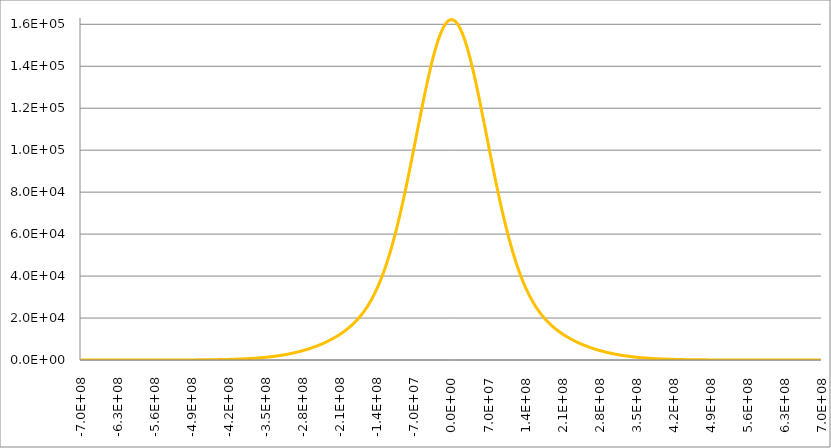
| Category | Series 1 | Series 0 | Series 2 | Series 3 |
|---|---|---|---|---|
| -695700000.0 |  |  |  | 0 |
| -695004300.0 |  |  |  | 0.001 |
| -694308600.0 |  |  |  | 0.003 |
| -693612900.0 |  |  |  | 0.004 |
| -692917200.0 |  |  |  | 0.005 |
| -692221500.0 |  |  |  | 0.007 |
| -691525800.0 |  |  |  | 0.008 |
| -690830100.0 |  |  |  | 0.009 |
| -690134400.0 |  |  |  | 0.011 |
| -689438700.0 |  |  |  | 0.013 |
| -688743000.0 |  |  |  | 0.014 |
| -688047300.0 |  |  |  | 0.016 |
| -687351600.0 |  |  |  | 0.017 |
| -686655900.0 |  |  |  | 0.019 |
| -685960200.0 |  |  |  | 0.021 |
| -685264500.0 |  |  |  | 0.023 |
| -684568800.0 |  |  |  | 0.024 |
| -683873100.0 |  |  |  | 0.026 |
| -683177400.0 |  |  |  | 0.028 |
| -682481700.0 |  |  |  | 0.03 |
| -681786000.0 |  |  |  | 0.032 |
| -681090300.0 |  |  |  | 0.034 |
| -680394600.0 |  |  |  | 0.037 |
| -679698900.0 |  |  |  | 0.039 |
| -679003200.0 |  |  |  | 0.041 |
| -678307500.0 |  |  |  | 0.043 |
| -677611800.0 |  |  |  | 0.046 |
| -676916100.0 |  |  |  | 0.048 |
| -676220400.0 |  |  |  | 0.051 |
| -675524700.0 |  |  |  | 0.053 |
| -674829000.0 |  |  |  | 0.056 |
| -674133300.0 |  |  |  | 0.059 |
| -673437600.0 |  |  |  | 0.062 |
| -672741900.0 |  |  |  | 0.064 |
| -672046200.0 |  |  |  | 0.067 |
| -671350500.0 |  |  |  | 0.07 |
| -670654800.0 |  |  |  | 0.074 |
| -669959100.0 |  |  |  | 0.077 |
| -669263400.0 |  |  |  | 0.08 |
| -668567700.0 |  |  |  | 0.083 |
| -667872000.0 |  |  |  | 0.087 |
| -667176300.0 |  |  |  | 0.09 |
| -666480600.0 |  |  |  | 0.094 |
| -665784900.0 |  |  |  | 0.097 |
| -665089200.0 |  |  |  | 0.101 |
| -664393500.0 |  |  |  | 0.105 |
| -663697800.0 |  |  |  | 0.109 |
| -663002100.0 |  |  |  | 0.113 |
| -662306400.0 |  |  |  | 0.117 |
| -661610700.0 |  |  |  | 0.122 |
| -660915000.0 |  |  |  | 0.126 |
| -660219300.0 |  |  |  | 0.131 |
| -659523600.0 |  |  |  | 0.135 |
| -658827900.0 |  |  |  | 0.14 |
| -658132200.0 |  |  |  | 0.145 |
| -657436500.0 |  |  |  | 0.15 |
| -656740800.0 |  |  |  | 0.155 |
| -656045100.0 |  |  |  | 0.16 |
| -655349400.0 |  |  |  | 0.166 |
| -654653700.0 |  |  |  | 0.171 |
| -653958000.0 |  |  |  | 0.177 |
| -653262300.0 |  |  |  | 0.182 |
| -652566600.0 |  |  |  | 0.188 |
| -651870900.0 |  |  |  | 0.194 |
| -651175200.0 |  |  |  | 0.201 |
| -650479500.0 |  |  |  | 0.207 |
| -649783800.0 |  |  |  | 0.214 |
| -649088100.0 |  |  |  | 0.22 |
| -648392400.0 |  |  |  | 0.227 |
| -647696700.0 |  |  |  | 0.234 |
| -647001000.0 |  |  |  | 0.241 |
| -646305300.0 |  |  |  | 0.249 |
| -645609600.0 |  |  |  | 0.256 |
| -644913900.0 |  |  |  | 0.264 |
| -644218200.0 |  |  |  | 0.272 |
| -643522500.0 |  |  |  | 0.28 |
| -642826800.0 |  |  |  | 0.289 |
| -642131100.0 |  |  |  | 0.297 |
| -641435400.0 |  |  |  | 0.306 |
| -640739700.0 |  |  |  | 0.315 |
| -640044000.0 |  |  |  | 0.324 |
| -639348300.0 |  |  |  | 0.334 |
| -638652600.0 |  |  |  | 0.343 |
| -637956900.0 |  |  |  | 0.353 |
| -637261200.0 |  |  |  | 0.363 |
| -636565500.0 |  |  |  | 0.374 |
| -635869800.0 |  |  |  | 0.384 |
| -635174100.0 |  |  |  | 0.395 |
| -634478400.0 |  |  |  | 0.406 |
| -633782700.0 |  |  |  | 0.418 |
| -633087000.0 |  |  |  | 0.429 |
| -632391300.0 |  |  |  | 0.441 |
| -631695600.0 |  |  |  | 0.454 |
| -630999900.0 |  |  |  | 0.466 |
| -630304200.0 |  |  |  | 0.479 |
| -629608500.0 |  |  |  | 0.492 |
| -628912800.0 |  |  |  | 0.506 |
| -628217100.0 |  |  |  | 0.52 |
| -627521400.0 |  |  |  | 0.534 |
| -626825700.0 |  |  |  | 0.548 |
| -626130000.0 |  |  |  | 0.563 |
| -625434300.0 |  |  |  | 0.578 |
| -624738600.0 |  |  |  | 0.594 |
| -624042900.0 |  |  |  | 0.61 |
| -623347200.0 |  |  |  | 0.626 |
| -622651500.0 |  |  |  | 0.643 |
| -621955800.0 |  |  |  | 0.66 |
| -621260100.0 |  |  |  | 0.677 |
| -620564400.0 |  |  |  | 0.695 |
| -619868700.0 |  |  |  | 0.713 |
| -619173000.0 |  |  |  | 0.732 |
| -618477300.0 |  |  |  | 0.751 |
| -617781600.0 |  |  |  | 0.771 |
| -617085900.0 |  |  |  | 0.791 |
| -616390200.0 |  |  |  | 0.812 |
| -615694500.0 |  |  |  | 0.833 |
| -614998800.0 |  |  |  | 0.854 |
| -614303100.0 |  |  |  | 0.876 |
| -613607400.0 |  |  |  | 0.899 |
| -612911700.0 |  |  |  | 0.922 |
| -612216000.0 |  |  |  | 0.946 |
| -611520300.0 |  |  |  | 0.97 |
| -610824600.0 |  |  |  | 0.995 |
| -610128900.0 |  |  |  | 1.02 |
| -609433200.0 |  |  |  | 1.046 |
| -608737500.0 |  |  |  | 1.072 |
| -608041800.0 |  |  |  | 1.099 |
| -607346100.0 |  |  |  | 1.127 |
| -606650400.0 |  |  |  | 1.156 |
| -605954700.0 |  |  |  | 1.185 |
| -605259000.0 |  |  |  | 1.214 |
| -604563300.0 |  |  |  | 1.245 |
| -603867600.0 |  |  |  | 1.276 |
| -603171900.0 |  |  |  | 1.308 |
| -602476200.0 |  |  |  | 1.34 |
| -601780500.0 |  |  |  | 1.373 |
| -601084800.0 |  |  |  | 1.407 |
| -600389100.0 |  |  |  | 1.442 |
| -599693400.0 |  |  |  | 1.478 |
| -598997700.0 |  |  |  | 1.514 |
| -598302000.0 |  |  |  | 1.552 |
| -597606300.0 |  |  |  | 1.59 |
| -596910600.0 |  |  |  | 1.629 |
| -596214900.0 |  |  |  | 1.668 |
| -595519200.0 |  |  |  | 1.709 |
| -594823500.0 |  |  |  | 1.751 |
| -594127800.0 |  |  |  | 1.793 |
| -593432100.0 |  |  |  | 1.837 |
| -592736400.0 |  |  |  | 1.881 |
| -592040700.0 |  |  |  | 1.927 |
| -591345000.0 |  |  |  | 1.973 |
| -590649300.0 |  |  |  | 2.021 |
| -589953600.0 |  |  |  | 2.07 |
| -589257900.0 |  |  |  | 2.119 |
| -588562200.0 |  |  |  | 2.17 |
| -587866500.0 |  |  |  | 2.222 |
| -587170800.0 |  |  |  | 2.275 |
| -586475100.0 |  |  |  | 2.33 |
| -585779400.0 |  |  |  | 2.385 |
| -585083700.0 |  |  |  | 2.442 |
| -584388000.0 |  |  |  | 2.5 |
| -583692300.0 |  |  |  | 2.559 |
| -582996600.0 |  |  |  | 2.62 |
| -582300900.0 |  |  |  | 2.682 |
| -581605200.0 |  |  |  | 2.745 |
| -580909500.0 |  |  |  | 2.81 |
| -580213800.0 |  |  |  | 2.876 |
| -579518100.0 |  |  |  | 2.943 |
| -578822400.0 |  |  |  | 3.012 |
| -578126700.0 |  |  |  | 3.083 |
| -577431000.0 |  |  |  | 3.155 |
| -576735300.0 |  |  |  | 3.228 |
| -576039600.0 |  |  |  | 3.304 |
| -575343900.0 |  |  |  | 3.38 |
| -574648200.0 |  |  |  | 3.459 |
| -573952500.0 |  |  |  | 3.539 |
| -573256800.0 |  |  |  | 3.621 |
| -572561100.0 |  |  |  | 3.705 |
| -571865400.0 |  |  |  | 3.791 |
| -571169700.0 |  |  |  | 3.878 |
| -570474000.0 |  |  |  | 3.967 |
| -569778300.0 |  |  |  | 4.058 |
| -569082600.0 |  |  |  | 4.152 |
| -568386900.0 |  |  |  | 4.247 |
| -567691200.0 |  |  |  | 4.344 |
| -566995500.0 |  |  |  | 4.443 |
| -566299800.0 |  |  |  | 4.545 |
| -565604100.0 |  |  |  | 4.648 |
| -564908400.0 |  |  |  | 4.754 |
| -564212700.0 |  |  |  | 4.862 |
| -563517000.0 |  |  |  | 4.972 |
| -562821300.0 |  |  |  | 5.085 |
| -562125600.0 |  |  |  | 5.2 |
| -561429900.0 |  |  |  | 5.317 |
| -560734200.0 |  |  |  | 5.437 |
| -560038500.0 |  |  |  | 5.56 |
| -559342800.0 |  |  |  | 5.685 |
| -558647100.0 |  |  |  | 5.812 |
| -557951400.0 |  |  |  | 5.943 |
| -557255700.0 |  |  |  | 6.076 |
| -556560000.0 |  |  |  | 6.212 |
| -555864300.0 |  |  |  | 6.35 |
| -555168600.0 |  |  |  | 6.492 |
| -554472900.0 |  |  |  | 6.637 |
| -553777200.0 |  |  |  | 6.784 |
| -553081500.0 |  |  |  | 6.935 |
| -552385800.0 |  |  |  | 7.089 |
| -551690100.0 |  |  |  | 7.245 |
| -550994400.0 |  |  |  | 7.406 |
| -550298700.0 |  |  |  | 7.569 |
| -549603000.0 |  |  |  | 7.736 |
| -548907300.0 |  |  |  | 7.906 |
| -548211600.0 |  |  |  | 8.08 |
| -547515900.0 |  |  |  | 8.258 |
| -546820200.0 |  |  |  | 8.439 |
| -546124500.0 |  |  |  | 8.623 |
| -545428800.0 |  |  |  | 8.812 |
| -544733100.0 |  |  |  | 9.004 |
| -544037400.0 |  |  |  | 9.201 |
| -543341700.0 |  |  |  | 9.401 |
| -542646000.0 |  |  |  | 9.605 |
| -541950300.0 |  |  |  | 9.814 |
| -541254600.0 |  |  |  | 10.027 |
| -540558900.0 |  |  |  | 10.244 |
| -539863200.0 |  |  |  | 10.465 |
| -539167500.0 |  |  |  | 10.691 |
| -538471800.0 |  |  |  | 10.922 |
| -537776100.0 |  |  |  | 11.157 |
| -537080400.0 |  |  |  | 11.397 |
| -536384700.0 |  |  |  | 11.641 |
| -535689000.0 |  |  |  | 11.891 |
| -534993300.0 |  |  |  | 12.145 |
| -534297600.0 |  |  |  | 12.405 |
| -533601900.0 |  |  |  | 12.67 |
| -532906200.0 |  |  |  | 12.94 |
| -532210500.0 |  |  |  | 13.216 |
| -531514800.0 |  |  |  | 13.497 |
| -530819100.0 |  |  |  | 13.783 |
| -530123400.0 |  |  |  | 14.075 |
| -529427700.0 |  |  |  | 14.373 |
| -528732000.0 |  |  |  | 14.677 |
| -528036300.0 |  |  |  | 14.987 |
| -527340600.0 |  |  |  | 15.303 |
| -526644900.0 |  |  |  | 15.625 |
| -525949200.0 |  |  |  | 15.954 |
| -525253500.0 |  |  |  | 16.289 |
| -524557800.0 |  |  |  | 16.63 |
| -523862100.0 |  |  |  | 16.979 |
| -523166400.0 |  |  |  | 17.334 |
| -522470700.0 |  |  |  | 17.696 |
| -521775000.0 |  |  |  | 18.065 |
| -521079300.0 |  |  |  | 18.441 |
| -520383600.0 |  |  |  | 18.824 |
| -519687900.0 |  |  |  | 19.215 |
| -518992200.0 |  |  |  | 19.613 |
| -518296500.0 |  |  |  | 20.019 |
| -517600800.0 |  |  |  | 20.433 |
| -516905100.0 |  |  |  | 20.855 |
| -516209400.0 |  |  |  | 21.285 |
| -515513700.0 |  |  |  | 21.723 |
| -514818000.0 |  |  |  | 22.17 |
| -514122300.0 |  |  |  | 22.625 |
| -513426600.0 |  |  |  | 23.089 |
| -512730900.0 |  |  |  | 23.562 |
| -512035200.0 |  |  |  | 24.044 |
| -511339500.0 |  |  |  | 24.534 |
| -510643800.0 |  |  |  | 25.035 |
| -509948100.0 |  |  |  | 25.544 |
| -509252400.0 |  |  |  | 26.063 |
| -508556700.0 |  |  |  | 26.593 |
| -507861000.0 |  |  |  | 27.132 |
| -507165300.0 |  |  |  | 27.681 |
| -506469600.0 |  |  |  | 28.24 |
| -505773900.0 |  |  |  | 28.81 |
| -505078200.0 |  |  |  | 29.391 |
| -504382500.0 |  |  |  | 29.983 |
| -503686800.0 |  |  |  | 30.585 |
| -502991100.0 |  |  |  | 31.199 |
| -502295400.0 |  |  |  | 31.825 |
| -501599700.0 |  |  |  | 32.462 |
| -500904000.0 |  |  |  | 33.11 |
| -500208300.0 |  |  |  | 33.771 |
| -499512600.0 |  |  |  | 34.444 |
| -498816900.0 |  |  |  | 35.13 |
| -498121200.0 |  |  |  | 35.828 |
| -497425500.0 |  |  |  | 36.539 |
| -496729800.0 |  |  |  | 37.263 |
| -496034100.0 |  |  |  | 38 |
| -495338400.0 |  |  |  | 38.751 |
| -494642700.0 |  |  |  | 39.515 |
| -493947000.0 |  |  |  | 40.294 |
| -493251300.0 |  |  |  | 41.086 |
| -492555600.0 |  |  |  | 41.893 |
| -491859900.0 |  |  |  | 42.715 |
| -491164200.0 |  |  |  | 43.552 |
| -490468500.0 |  |  |  | 44.403 |
| -489772800.0 |  |  |  | 45.271 |
| -489077100.0 |  |  |  | 46.153 |
| -488381400.0 |  |  |  | 47.052 |
| -487685700.0 |  |  |  | 47.967 |
| -486990000.0 |  |  |  | 48.899 |
| -486294300.0 |  |  |  | 49.847 |
| -485598600.0 |  |  |  | 50.812 |
| -484902900.0 |  |  |  | 51.794 |
| -484207200.0 |  |  |  | 52.794 |
| -483511500.0 |  |  |  | 53.811 |
| -482815800.0 |  |  |  | 54.847 |
| -482120100.0 |  |  |  | 55.901 |
| -481424400.0 |  |  |  | 56.974 |
| -480728700.0 |  |  |  | 58.066 |
| -480033000.0 |  |  |  | 59.177 |
| -479337300.0 |  |  |  | 60.307 |
| -478641600.0 |  |  |  | 61.458 |
| -477945900.0 |  |  |  | 62.628 |
| -477250200.0 |  |  |  | 63.82 |
| -476554500.0 |  |  |  | 65.032 |
| -475858800.0 |  |  |  | 66.265 |
| -475163100.0 |  |  |  | 67.52 |
| -474467400.0 |  |  |  | 68.796 |
| -473771700.0 |  |  |  | 70.095 |
| -473076000.0 |  |  |  | 71.417 |
| -472380300.0 |  |  |  | 72.761 |
| -471684600.0 |  |  |  | 74.128 |
| -470988900.0 |  |  |  | 75.52 |
| -470293200.0 |  |  |  | 76.935 |
| -469597500.0 |  |  |  | 78.374 |
| -468901800.0 |  |  |  | 79.838 |
| -468206100.0 |  |  |  | 81.328 |
| -467510400.0 |  |  |  | 82.843 |
| -466814700.0 |  |  |  | 84.383 |
| -466119000.0 |  |  |  | 85.95 |
| -465423300.0 |  |  |  | 87.544 |
| -464727600.0 |  |  |  | 89.165 |
| -464031900.0 |  |  |  | 90.813 |
| -463336200.0 |  |  |  | 92.489 |
| -462640500.0 |  |  |  | 94.194 |
| -461944800.0 |  |  |  | 95.927 |
| -461249100.0 |  |  |  | 97.689 |
| -460553400.0 |  |  |  | 99.481 |
| -459857700.0 |  |  |  | 101.304 |
| -459162000.0 |  |  |  | 103.156 |
| -458466300.0 |  |  |  | 105.04 |
| -457770600.0 |  |  |  | 106.955 |
| -457074900.0 |  |  |  | 108.902 |
| -456379200.0 |  |  |  | 110.882 |
| -455683500.0 |  |  |  | 112.894 |
| -454987800.0 |  |  |  | 114.94 |
| -454292100.0 |  |  |  | 117.019 |
| -453596400.0 |  |  |  | 119.133 |
| -452900700.0 |  |  |  | 121.282 |
| -452205000.0 |  |  |  | 123.466 |
| -451509300.0 |  |  |  | 125.686 |
| -450813600.0 |  |  |  | 127.942 |
| -450117900.0 |  |  |  | 130.235 |
| -449422200.0 |  |  |  | 132.566 |
| -448726500.0 |  |  |  | 134.935 |
| -448030800.0 |  |  |  | 137.342 |
| -447335100.0 |  |  |  | 139.788 |
| -446639400.0 |  |  |  | 142.274 |
| -445943700.0 |  |  |  | 144.8 |
| -445248000.0 |  |  |  | 147.367 |
| -444552300.0 |  |  |  | 149.976 |
| -443856600.0 |  |  |  | 152.626 |
| -443160900.0 |  |  |  | 155.319 |
| -442465200.0 |  |  |  | 158.055 |
| -441769500.0 |  |  |  | 160.835 |
| -441073800.0 |  |  |  | 163.659 |
| -440378100.0 |  |  |  | 166.528 |
| -439682400.0 |  |  |  | 169.443 |
| -438986700.0 |  |  |  | 172.404 |
| -438291000.0 |  |  |  | 175.412 |
| -437595300.0 |  |  |  | 178.468 |
| -436899600.0 |  |  |  | 181.572 |
| -436203900.0 |  |  |  | 184.724 |
| -435508200.0 |  |  |  | 187.927 |
| -434812500.0 |  |  |  | 191.179 |
| -434116800.0 |  |  |  | 194.483 |
| -433421100.0 |  |  |  | 197.838 |
| -432725400.0 |  |  |  | 201.246 |
| -432029700.0 |  |  |  | 204.706 |
| -431334000.0 |  |  |  | 208.22 |
| -430638300.0 |  |  |  | 211.789 |
| -429942600.0 |  |  |  | 215.414 |
| -429246900.0 |  |  |  | 219.094 |
| -428551200.0 |  |  |  | 222.831 |
| -427855500.0 |  |  |  | 226.625 |
| -427159800.0 |  |  |  | 230.478 |
| -426464100.0 |  |  |  | 234.389 |
| -425768400.0 |  |  |  | 238.361 |
| -425072700.0 |  |  |  | 242.393 |
| -424377000.0 |  |  |  | 246.487 |
| -423681300.0 |  |  |  | 250.642 |
| -422985600.0 |  |  |  | 254.861 |
| -422289900.0 |  |  |  | 259.144 |
| -421594200.0 |  |  |  | 263.492 |
| -420898500.0 |  |  |  | 267.905 |
| -420202800.0 |  |  |  | 272.384 |
| -419507100.0 |  |  |  | 276.931 |
| -418811400.0 |  |  |  | 281.546 |
| -418115700.0 |  |  |  | 286.23 |
| -417420000.0 |  |  |  | 290.984 |
| -416724300.0 |  |  |  | 295.809 |
| -416028600.0 |  |  |  | 300.706 |
| -415332900.0 |  |  |  | 305.675 |
| -414637200.0 |  |  |  | 310.718 |
| -413941500.0 |  |  |  | 315.835 |
| -413245800.0 |  |  |  | 321.028 |
| -412550100.0 |  |  |  | 326.297 |
| -411854400.0 |  |  |  | 331.643 |
| -411158700.0 |  |  |  | 337.068 |
| -410463000.0 |  |  |  | 342.572 |
| -409767300.0 |  |  |  | 348.157 |
| -409071600.0 |  |  |  | 353.823 |
| -408375900.0 |  |  |  | 359.571 |
| -407680200.0 |  |  |  | 365.403 |
| -406984500.0 |  |  |  | 371.319 |
| -406288800.0 |  |  |  | 377.32 |
| -405593100.0 |  |  |  | 383.408 |
| -404897400.0 |  |  |  | 389.583 |
| -404201700.0 |  |  |  | 395.847 |
| -403506000.0 |  |  |  | 402.201 |
| -402810300.0 |  |  |  | 408.645 |
| -402114600.0 |  |  |  | 415.181 |
| -401418900.0 |  |  |  | 421.81 |
| -400723200.0 |  |  |  | 428.534 |
| -400027500.0 |  |  |  | 435.352 |
| -399331800.0 |  |  |  | 442.267 |
| -398636100.0 |  |  |  | 449.279 |
| -397940400.0 |  |  |  | 456.39 |
| -397244700.0 |  |  |  | 463.601 |
| -396549000.0 |  |  |  | 470.913 |
| -395853300.0 |  |  |  | 478.327 |
| -395157600.0 |  |  |  | 485.844 |
| -394461900.0 |  |  |  | 493.466 |
| -393766200.0 |  |  |  | 501.194 |
| -393070500.0 |  |  |  | 509.029 |
| -392374800.0 |  |  |  | 516.972 |
| -391679100.0 |  |  |  | 525.025 |
| -390983400.0 |  |  |  | 533.188 |
| -390287700.0 |  |  |  | 541.464 |
| -389592000.0 |  |  |  | 549.853 |
| -388896300.0 |  |  |  | 558.356 |
| -388200600.0 |  |  |  | 566.976 |
| -387504900.0 |  |  |  | 575.713 |
| -386809200.0 |  |  |  | 584.568 |
| -386113500.0 |  |  |  | 593.543 |
| -385417800.0 |  |  |  | 602.64 |
| -384722100.0 |  |  |  | 611.859 |
| -384026400.0 |  |  |  | 621.202 |
| -383330700.0 |  |  |  | 630.67 |
| -382635000.0 |  |  |  | 640.266 |
| -381939300.0 |  |  |  | 649.989 |
| -381243600.0 |  |  |  | 659.842 |
| -380547900.0 |  |  |  | 669.826 |
| -379852200.0 |  |  |  | 679.942 |
| -379156500.0 |  |  |  | 690.192 |
| -378460800.0 |  |  |  | 700.578 |
| -377765100.0 |  |  |  | 711.1 |
| -377069400.0 |  |  |  | 721.761 |
| -376373700.0 |  |  |  | 732.561 |
| -375678000.0 |  |  |  | 743.502 |
| -374982300.0 |  |  |  | 754.587 |
| -374286600.0 |  |  |  | 765.815 |
| -373590900.0 |  |  |  | 777.189 |
| -372895200.0 |  |  |  | 788.711 |
| -372199500.0 |  |  |  | 800.381 |
| -371503800.0 |  |  |  | 812.202 |
| -370808100.0 |  |  |  | 824.174 |
| -370112400.0 |  |  |  | 836.3 |
| -369416700.0 |  |  |  | 848.582 |
| -368721000.0 |  |  |  | 861.02 |
| -368025300.0 |  |  |  | 873.616 |
| -367329600.0 |  |  |  | 886.373 |
| -366633900.0 |  |  |  | 899.291 |
| -365938200.0 |  |  |  | 912.372 |
| -365242500.0 |  |  |  | 925.618 |
| -364546800.0 |  |  |  | 939.031 |
| -363851100.0 |  |  |  | 952.612 |
| -363155400.0 |  |  |  | 966.363 |
| -362459700.0 |  |  |  | 980.286 |
| -361764000.0 |  |  |  | 994.381 |
| -361068300.0 |  |  |  | 1008.652 |
| -360372600.0 |  |  |  | 1023.1 |
| -359676900.0 |  |  |  | 1037.726 |
| -358981200.0 |  |  |  | 1052.533 |
| -358285500.0 |  |  |  | 1067.521 |
| -357589800.0 |  |  |  | 1082.693 |
| -356894100.0 |  |  |  | 1098.051 |
| -356198400.0 |  |  |  | 1113.596 |
| -355502700.0 |  |  |  | 1129.33 |
| -354807000.0 |  |  |  | 1145.256 |
| -354111300.0 |  |  |  | 1161.373 |
| -353415600.0 |  |  |  | 1177.686 |
| -352719900.0 |  |  |  | 1194.195 |
| -352024200.0 |  |  |  | 1210.902 |
| -351328500.0 |  |  |  | 1227.809 |
| -350632800.0 |  |  |  | 1244.918 |
| -349937100.0 |  |  |  | 1262.231 |
| -349241400.0 |  |  |  | 1279.75 |
| -348545700.0 |  |  |  | 1297.477 |
| -347850000.0 |  |  |  | 1315.412 |
| -347154300.0 |  |  |  | 1333.56 |
| -346458600.0 |  |  |  | 1351.921 |
| -345762900.0 |  |  |  | 1370.496 |
| -345067200.0 |  |  |  | 1389.29 |
| -344371500.0 |  |  |  | 1408.302 |
| -343675800.0 |  |  |  | 1427.536 |
| -342980100.0 |  |  |  | 1446.992 |
| -342284400.0 |  |  |  | 1466.674 |
| -341588700.0 |  |  |  | 1486.583 |
| -340893000.0 |  |  |  | 1506.72 |
| -340197300.0 |  |  |  | 1527.089 |
| -339501600.0 |  |  |  | 1547.691 |
| -338805900.0 |  |  |  | 1568.528 |
| -338110200.0 |  |  |  | 1589.602 |
| -337414500.0 |  |  |  | 1610.915 |
| -336718800.0 |  |  |  | 1632.469 |
| -336023100.0 |  |  |  | 1654.267 |
| -335327400.0 |  |  |  | 1676.309 |
| -334631700.0 |  |  |  | 1698.599 |
| -333936000.0 |  |  |  | 1721.139 |
| -333240300.0 |  |  |  | 1743.93 |
| -332544600.0 |  |  |  | 1766.974 |
| -331848900.0 |  |  |  | 1790.274 |
| -331153200.0 |  |  |  | 1813.832 |
| -330457500.0 |  |  |  | 1837.65 |
| -329761800.0 |  |  |  | 1861.73 |
| -329066100.0 |  |  |  | 1886.074 |
| -328370400.0 |  |  |  | 1910.684 |
| -327674700.0 |  |  |  | 1935.562 |
| -326979000.0 |  |  |  | 1960.711 |
| -326283300.0 |  |  |  | 1986.133 |
| -325587600.0 |  |  |  | 2011.829 |
| -324891900.0 |  |  |  | 2037.803 |
| -324196200.0 |  |  |  | 2064.056 |
| -323500500.0 |  |  |  | 2090.59 |
| -322804800.0 |  |  |  | 2117.407 |
| -322109100.0 |  |  |  | 2144.511 |
| -321413400.0 |  |  |  | 2171.902 |
| -320717700.0 |  |  |  | 2199.583 |
| -320022000.0 |  |  |  | 2227.557 |
| -319326300.0 |  |  |  | 2255.825 |
| -318630600.0 |  |  |  | 2284.39 |
| -317934900.0 |  |  |  | 2313.254 |
| -317239200.0 |  |  |  | 2342.419 |
| -316543500.0 |  |  |  | 2371.888 |
| -315847800.0 |  |  |  | 2401.663 |
| -315152100.0 |  |  |  | 2431.745 |
| -314456400.0 |  |  |  | 2462.137 |
| -313760700.0 |  |  |  | 2492.842 |
| -313065000.0 |  |  |  | 2523.862 |
| -312369300.0 |  |  |  | 2555.199 |
| -311673600.0 |  |  |  | 2586.855 |
| -310977900.0 |  |  |  | 2618.832 |
| -310282200.0 |  |  |  | 2651.133 |
| -309586500.0 |  |  |  | 2683.761 |
| -308890800.0 |  |  |  | 2716.717 |
| -308195100.0 |  |  |  | 2750.003 |
| -307499400.0 |  |  |  | 2783.623 |
| -306803700.0 |  |  |  | 2817.578 |
| -306108000.0 |  |  |  | 2851.87 |
| -305412300.0 |  |  |  | 2886.503 |
| -304716600.0 |  |  |  | 2921.477 |
| -304020900.0 |  |  |  | 2956.797 |
| -303325200.0 |  |  |  | 2992.463 |
| -302629500.0 |  |  |  | 3028.479 |
| -301933800.0 |  |  |  | 3064.846 |
| -301238100.0 |  |  |  | 3101.567 |
| -300542400.0 |  |  |  | 3138.645 |
| -299846700.0 |  |  |  | 3176.081 |
| -299151000.0 |  |  |  | 3213.879 |
| -298455300.0 |  |  |  | 3252.039 |
| -297759600.0 |  |  |  | 3290.566 |
| -297063900.0 |  |  |  | 3329.461 |
| -296368200.0 |  |  |  | 3368.726 |
| -295672500.0 |  |  |  | 3408.365 |
| -294976800.0 |  |  |  | 3448.379 |
| -294281100.0 |  |  |  | 3488.77 |
| -293585400.0 |  |  |  | 3529.542 |
| -292889700.0 |  |  |  | 3570.696 |
| -292194000.0 |  |  |  | 3612.236 |
| -291498300.0 |  |  |  | 3654.163 |
| -290802600.0 |  |  |  | 3696.48 |
| -290106900.0 |  |  |  | 3739.189 |
| -289411200.0 |  |  |  | 3782.293 |
| -288715500.0 |  |  |  | 3825.795 |
| -288019800.0 |  |  |  | 3869.696 |
| -287324100.0 |  |  |  | 3914 |
| -286628400.0 |  |  |  | 3958.708 |
| -285932700.0 |  |  |  | 4003.824 |
| -285237000.0 |  |  |  | 4049.349 |
| -284541300.0 |  |  |  | 4095.287 |
| -283845600.0 |  |  |  | 4141.639 |
| -283149900.0 |  |  |  | 4188.409 |
| -282454200.0 |  |  |  | 4235.599 |
| -281758500.0 |  |  |  | 4283.211 |
| -281062800.0 |  |  |  | 4331.249 |
| -280367100.0 |  |  |  | 4379.714 |
| -279671400.0 |  |  |  | 4428.609 |
| -278975700.0 |  |  |  | 4477.938 |
| -278280000.0 |  |  |  | 4527.701 |
| -277584300.0 |  |  |  | 4577.904 |
| -276888600.0 |  |  |  | 4628.547 |
| -276192900.0 |  |  |  | 4679.633 |
| -275497200.0 |  |  |  | 4731.166 |
| -274801500.0 |  |  |  | 4783.148 |
| -274105800.0 |  |  |  | 4835.582 |
| -273410100.0 |  |  |  | 4888.47 |
| -272714400.0 |  |  |  | 4941.816 |
| -272018700.0 |  |  |  | 4995.622 |
| -271323000.0 |  |  |  | 5049.89 |
| -270627300.0 |  |  |  | 5104.625 |
| -269931600.0 |  |  |  | 5159.829 |
| -269235900.0 |  |  |  | 5215.504 |
| -268540200.0 |  |  |  | 5271.653 |
| -267844500.0 |  |  |  | 5328.281 |
| -267148800.0 |  |  |  | 5385.388 |
| -266453100.0 |  |  |  | 5442.98 |
| -265757400.0 |  |  |  | 5501.058 |
| -265061700.0 |  |  |  | 5559.626 |
| -264366000.0 |  |  |  | 5618.687 |
| -263670300.0 |  |  |  | 5678.244 |
| -262974600.0 |  |  |  | 5738.301 |
| -262278900.0 |  |  |  | 5798.86 |
| -261583200.0 |  |  |  | 5859.925 |
| -260887500.0 |  |  |  | 5921.499 |
| -260191800.0 |  |  |  | 5983.586 |
| -259496100.0 |  |  |  | 6046.189 |
| -258800400.0 |  |  |  | 6109.311 |
| -258104700.0 |  |  |  | 6172.957 |
| -257409000.0 |  |  |  | 6237.129 |
| -256713300.0 |  |  |  | 6301.832 |
| -256017600.0 |  |  |  | 6367.069 |
| -255321900.0 |  |  |  | 6432.844 |
| -254626200.0 |  |  |  | 6499.16 |
| -253930500.0 |  |  |  | 6566.022 |
| -253234800.0 |  |  |  | 6633.434 |
| -252539100.0 |  |  |  | 6701.399 |
| -251843400.0 |  |  |  | 6769.922 |
| -251147700.0 |  |  |  | 6839.006 |
| -250452000.0 |  |  |  | 6908.657 |
| -249756300.0 |  |  |  | 6978.878 |
| -249060600.0 |  |  |  | 7049.675 |
| -248364900.0 |  |  |  | 7121.05 |
| -247669200.0 |  |  |  | 7193.01 |
| -246973500.0 |  |  |  | 7265.558 |
| -246277800.0 |  |  |  | 7338.7 |
| -245582100.0 |  |  |  | 7412.44 |
| -244886400.0 |  |  |  | 7486.783 |
| -244190700.0 |  |  |  | 7561.735 |
| -243495000.0 |  |  |  | 7637.3 |
| -242799300.0 |  |  |  | 7713.485 |
| -242103600.0 |  |  |  | 7790.293 |
| -241407900.0 |  |  |  | 7867.732 |
| -240712200.0 |  |  |  | 7945.806 |
| -240016500.0 |  |  |  | 8024.521 |
| -239320800.0 |  |  |  | 8103.883 |
| -238625100.0 |  |  |  | 8183.899 |
| -237929400.0 |  |  |  | 8264.574 |
| -237233700.0 |  |  |  | 8345.914 |
| -236538000.0 |  |  |  | 8427.927 |
| -235842300.0 |  |  |  | 8510.619 |
| -235146600.0 |  |  |  | 8593.997 |
| -234450900.0 |  |  |  | 8678.067 |
| -233755200.0 |  |  |  | 8762.836 |
| -233059500.0 |  |  |  | 8848.313 |
| -232363800.0 |  |  |  | 8934.504 |
| -231668100.0 |  |  |  | 9021.416 |
| -230972400.0 |  |  |  | 9109.059 |
| -230276700.0 |  |  |  | 9197.439 |
| -229581000.0 |  |  |  | 9286.566 |
| -228885300.0 |  |  |  | 9376.446 |
| -228189600.0 |  |  |  | 9467.09 |
| -227493900.0 |  |  |  | 9558.505 |
| -226798200.0 |  |  |  | 9650.701 |
| -226102500.0 |  |  |  | 9743.686 |
| -225406800.0 |  |  |  | 9837.471 |
| -224711100.0 |  |  |  | 9932.065 |
| -224015400.0 |  |  |  | 10027.478 |
| -223319700.0 |  |  |  | 10123.72 |
| -222624000.0 |  |  |  | 10220.802 |
| -221928300.0 |  |  |  | 10318.733 |
| -221232600.0 |  |  |  | 10417.526 |
| -220536900.0 |  |  |  | 10517.19 |
| -219841200.0 |  |  |  | 10617.739 |
| -219145500.0 |  |  |  | 10719.182 |
| -218449800.0 |  |  |  | 10821.533 |
| -217754100.0 |  |  |  | 10924.803 |
| -217058400.0 |  |  |  | 11029.006 |
| -216362700.0 |  |  |  | 11134.153 |
| -215667000.0 |  |  |  | 11240.259 |
| -214971300.0 |  |  |  | 11347.336 |
| -214275600.0 |  |  |  | 11455.399 |
| -213579900.0 |  |  |  | 11564.461 |
| -212884200.0 |  |  |  | 11674.538 |
| -212188500.0 |  |  |  | 11785.643 |
| -211492800.0 |  |  |  | 11897.793 |
| -210797100.0 |  |  |  | 12011.002 |
| -210101400.0 |  |  |  | 12125.286 |
| -209405700.0 |  |  |  | 12240.662 |
| -208710000.0 |  |  |  | 12357.147 |
| -208014300.0 |  |  |  | 12474.757 |
| -207318600.0 |  |  |  | 12593.509 |
| -206622900.0 |  |  |  | 12713.421 |
| -205927200.0 |  |  |  | 12834.512 |
| -205231500.0 |  |  |  | 12956.8 |
| -204535800.0 |  |  |  | 13080.304 |
| -203840100.0 |  |  |  | 13205.043 |
| -203144400.0 |  |  |  | 13331.038 |
| -202448700.0 |  |  |  | 13458.308 |
| -201753000.0 |  |  |  | 13586.873 |
| -201057300.0 |  |  |  | 13716.756 |
| -200361600.0 |  |  |  | 13847.978 |
| -199665900.0 |  |  |  | 13980.56 |
| -198970200.0 |  |  |  | 14114.525 |
| -198274500.0 |  |  |  | 14249.896 |
| -197578800.0 |  |  |  | 14386.696 |
| -196883100.0 |  |  |  | 14524.95 |
| -196187400.0 |  |  |  | 14664.681 |
| -195491700.0 |  |  |  | 14805.915 |
| -194796000.0 |  |  |  | 14948.676 |
| -194100300.0 |  |  |  | 15092.991 |
| -193404600.0 |  |  |  | 15238.885 |
| -192708900.0 |  |  |  | 15386.386 |
| -192013200.0 |  |  |  | 15535.521 |
| -191317500.0 |  |  |  | 15686.318 |
| -190621800.0 |  |  |  | 15838.805 |
| -189926100.0 |  |  |  | 15993.011 |
| -189230400.0 |  |  |  | 16148.965 |
| -188534700.0 |  |  |  | 16306.698 |
| -187839000.0 |  |  |  | 16466.24 |
| -187143300.0 |  |  |  | 16627.621 |
| -186447600.0 |  |  |  | 16790.874 |
| -185751900.0 |  |  |  | 16956.03 |
| -185056200.0 |  |  |  | 17123.122 |
| -184360500.0 |  |  |  | 17292.184 |
| -183664800.0 |  |  |  | 17463.248 |
| -182969100.0 |  |  |  | 17636.35 |
| -182273400.0 |  |  |  | 17811.524 |
| -181577700.0 |  |  |  | 17988.805 |
| -180882000.0 |  |  |  | 18168.23 |
| -180186300.0 |  |  |  | 18349.835 |
| -179490600.0 |  |  |  | 18533.657 |
| -178794900.0 |  |  |  | 18719.733 |
| -178099200.0 |  |  |  | 18908.101 |
| -177403500.0 |  |  |  | 19098.801 |
| -176707800.0 |  |  |  | 19291.872 |
| -176012100.0 |  |  |  | 19487.353 |
| -175316400.0 |  |  |  | 19685.285 |
| -174620700.0 |  |  |  | 19885.708 |
| -173925000.0 |  |  |  | 20088.664 |
| -173229300.0 |  |  |  | 20294.195 |
| -172533600.0 |  |  |  | 20502.343 |
| -171837900.0 |  |  |  | 20713.151 |
| -171142200.0 |  |  |  | 20926.663 |
| -170446500.0 |  |  |  | 21142.923 |
| -169750800.0 |  |  |  | 21361.975 |
| -169055100.0 |  |  |  | 21583.865 |
| -168359400.0 |  |  |  | 21808.637 |
| -167663700.0 |  |  |  | 22036.338 |
| -166968000.0 |  |  |  | 22267.015 |
| -166272300.0 |  |  |  | 22500.713 |
| -165576600.0 |  |  |  | 22737.481 |
| -164880900.0 |  |  |  | 22977.366 |
| -164185200.0 |  |  |  | 23220.417 |
| -163489500.0 |  |  |  | 23466.683 |
| -162793800.0 |  |  |  | 23716.211 |
| -162098100.0 |  |  |  | 23969.053 |
| -161402400.0 |  |  |  | 24225.257 |
| -160706700.0 |  |  |  | 24484.874 |
| -160011000.0 |  |  |  | 24747.955 |
| -159315300.0 |  |  |  | 25014.55 |
| -158619600.0 |  |  |  | 25284.711 |
| -157923900.0 |  |  |  | 25558.489 |
| -157228200.0 |  |  |  | 25835.937 |
| -156532500.0 |  |  |  | 26117.105 |
| -155836800.0 |  |  |  | 26402.048 |
| -155141100.0 |  |  |  | 26690.817 |
| -154445400.0 |  |  |  | 26983.464 |
| -153749700.0 |  |  |  | 27280.044 |
| -153054000.0 |  |  |  | 27580.61 |
| -152358300.0 |  |  |  | 27885.214 |
| -151662600.0 |  |  |  | 28193.91 |
| -150966900.0 |  |  |  | 28506.752 |
| -150271200.0 |  |  |  | 28823.793 |
| -149575500.0 |  |  |  | 29145.088 |
| -148879800.0 |  |  |  | 29470.689 |
| -148184100.0 |  |  |  | 29800.65 |
| -147488400.0 |  |  |  | 30135.026 |
| -146792700.0 |  |  |  | 30473.87 |
| -146097000.0 |  |  |  | 30817.234 |
| -145401300.0 |  |  |  | 31165.174 |
| -144705600.0 |  |  |  | 31517.742 |
| -144009900.0 |  |  |  | 31874.991 |
| -143314200.0 |  |  |  | 32236.974 |
| -142618500.0 |  |  |  | 32603.744 |
| -141922800.0 |  |  |  | 32975.353 |
| -141227100.0 |  |  |  | 33351.854 |
| -140531400.0 |  |  |  | 33733.297 |
| -139835700.0 |  |  |  | 34119.735 |
| -139140000.0 |  |  |  | 34511.218 |
| -138444300.0 |  |  |  | 34907.797 |
| -137748600.0 |  |  |  | 35309.522 |
| -137052900.0 |  |  |  | 35716.442 |
| -136357200.0 |  |  |  | 36128.607 |
| -135661500.0 |  |  |  | 36546.064 |
| -134965800.0 |  |  |  | 36968.862 |
| -134270100.0 |  |  |  | 37397.047 |
| -133574400.0 |  |  |  | 37830.665 |
| -132878700.0 |  |  |  | 38269.763 |
| -132183000.0 |  |  |  | 38714.385 |
| -131487300.0 |  |  |  | 39164.575 |
| -130791600.0 |  |  |  | 39620.375 |
| -130095900.0 |  |  |  | 40081.829 |
| -129400200.0 |  |  |  | 40548.976 |
| -128704500.0 |  |  |  | 41021.857 |
| -128008800.0 |  |  |  | 41500.512 |
| -127313100.0 |  |  |  | 41984.977 |
| -126617400.0 |  |  |  | 42475.29 |
| -125921700.0 |  |  |  | 42971.487 |
| -125226000.0 |  |  |  | 43473.6 |
| -124530300.0 |  |  |  | 43981.664 |
| -123834600.0 |  |  |  | 44495.711 |
| -123138900.0 |  |  |  | 45015.769 |
| -122443200.0 |  |  |  | 45541.869 |
| -121747500.0 |  |  |  | 46074.038 |
| -121051800.0 |  |  |  | 46612.301 |
| -120356100.0 |  |  |  | 47156.682 |
| -119660400.0 |  |  |  | 47707.205 |
| -118964700.0 |  |  |  | 48263.89 |
| -118269000.0 |  |  |  | 48826.757 |
| -117573300.0 |  |  |  | 49395.823 |
| -116877600.0 |  |  |  | 49971.103 |
| -116181900.0 |  |  |  | 50552.611 |
| -115486200.0 |  |  |  | 51140.36 |
| -114790500.0 |  |  |  | 51734.36 |
| -114094800.0 |  |  |  | 52334.617 |
| -113399100.0 |  |  |  | 52941.138 |
| -112703400.0 |  |  |  | 53553.928 |
| -112007700.0 |  |  |  | 54172.987 |
| -111312000.0 |  |  |  | 54798.315 |
| -110616300.0 |  |  |  | 55429.909 |
| -109920600.0 |  |  |  | 56067.765 |
| -109224900.0 |  |  |  | 56711.875 |
| -108529200.0 |  |  |  | 57362.229 |
| -107833500.0 |  |  |  | 58018.815 |
| -107137800.0 |  |  |  | 58681.618 |
| -106442100.0 |  |  |  | 59350.622 |
| -105746400.0 |  |  |  | 60025.807 |
| -105050700.0 |  |  |  | 60707.151 |
| -104355000.0 |  |  |  | 61394.629 |
| -103659300.0 |  |  |  | 62088.214 |
| -102963600.0 |  |  |  | 62787.875 |
| -102267900.0 |  |  |  | 63493.58 |
| -101572200.0 |  |  |  | 64205.293 |
| -100876500.0 |  |  |  | 64922.976 |
| -100180800.0 |  |  |  | 65646.587 |
| -99485100.0 |  |  |  | 66376.083 |
| -98789400.0 |  |  |  | 67111.417 |
| -98093700.0 |  |  |  | 67852.538 |
| -97398000.0 |  |  |  | 68599.394 |
| -96702300.0 |  |  |  | 69351.929 |
| -96006600.0 |  |  |  | 70110.085 |
| -95310900.0 |  |  |  | 70873.799 |
| -94615200.0 |  |  |  | 71643.006 |
| -93919500.0 |  |  |  | 72417.64 |
| -93223800.0 |  |  |  | 73197.627 |
| -92528100.0 |  |  |  | 73982.895 |
| -91832400.0 |  |  |  | 74773.366 |
| -91136700.0 |  |  |  | 75568.959 |
| -90441000.0 |  |  |  | 76369.591 |
| -89745300.0 |  |  |  | 77175.175 |
| -89049600.0 |  |  |  | 77985.621 |
| -88353900.0 |  |  |  | 78800.835 |
| -87658200.0 |  |  |  | 79620.722 |
| -86962500.0 |  |  |  | 80445.182 |
| -86266800.0 |  |  |  | 81274.111 |
| -85571100.0 |  |  |  | 82107.404 |
| -84875400.0 |  |  |  | 82944.951 |
| -84179700.0 |  |  |  | 83786.64 |
| -83484000.0 |  |  |  | 84632.355 |
| -82788300.0 |  |  |  | 85481.977 |
| -82092600.0 |  |  |  | 86335.384 |
| -81396900.0 |  |  |  | 87192.451 |
| -80701200.0 |  |  |  | 88053.048 |
| -80005500.0 |  |  |  | 88917.045 |
| -79309800.0 |  |  |  | 89784.306 |
| -78614100.0 |  |  |  | 90654.694 |
| -77918400.0 |  |  |  | 91528.067 |
| -77222700.0 |  |  |  | 92404.281 |
| -76527000.0 |  |  |  | 93283.19 |
| -75831300.0 |  |  |  | 94164.641 |
| -75135600.0 |  |  |  | 95048.483 |
| -74439900.0 |  |  |  | 95934.559 |
| -73744200.0 |  |  |  | 96822.709 |
| -73048500.0 |  |  |  | 97712.772 |
| -72352800.0 |  |  |  | 98604.583 |
| -71657100.0 |  |  |  | 99497.973 |
| -70961400.0 |  |  |  | 100392.772 |
| -70265700.0 |  |  |  | 101288.807 |
| -69570000.0 |  |  |  | 102185.9 |
| -68874300.0 |  |  |  | 103083.875 |
| -68178600.0 |  |  |  | 103982.549 |
| -67482900.0 |  |  |  | 104881.738 |
| -66787200.0 |  |  |  | 105781.257 |
| -66091500.0 |  |  |  | 106680.915 |
| -65395800.0 |  |  |  | 107580.522 |
| -64700100.0 |  |  |  | 108479.885 |
| -64004400.0 |  |  |  | 109378.807 |
| -63308700.0 |  |  |  | 110277.091 |
| -62613000.0 |  |  |  | 111174.536 |
| -61917300.0 |  |  |  | 112070.941 |
| -61221600.0 |  |  |  | 112966.101 |
| -60525900.0 |  |  |  | 113859.811 |
| -59830200.0 |  |  |  | 114751.862 |
| -59134500.0 |  |  |  | 115642.045 |
| -58438800.0 |  |  |  | 116530.148 |
| -57743100.0 |  |  |  | 117415.96 |
| -57047400.0 |  |  |  | 118299.264 |
| -56351700.0 |  |  |  | 119179.847 |
| -55656000.0 |  |  |  | 120057.491 |
| -54960300.0 |  |  |  | 120931.977 |
| -54264600.0 |  |  |  | 121803.086 |
| -53568900.0 |  |  |  | 122670.597 |
| -52873200.0 |  |  |  | 123534.29 |
| -52177500.0 |  |  |  | 124393.941 |
| -51481800.0 |  |  |  | 125249.328 |
| -50786100.0 |  |  |  | 126100.226 |
| -50090400.0 |  |  |  | 126946.412 |
| -49394700.0 |  |  |  | 127787.661 |
| -48699000.0 |  |  |  | 128623.747 |
| -48003300.0 |  |  |  | 129454.445 |
| -47307600.0 |  |  |  | 130279.529 |
| -46611900.0 |  |  |  | 131098.773 |
| -45916200.0 |  |  |  | 131911.953 |
| -45220500.0 |  |  |  | 132718.842 |
| -44524800.0 |  |  |  | 133519.215 |
| -43829100.0 |  |  |  | 134312.847 |
| -43133400.0 |  |  |  | 135099.513 |
| -42437700.0 |  |  |  | 135878.991 |
| -41742000.0 |  |  |  | 136651.057 |
| -41046300.0 |  |  |  | 137415.488 |
| -40350600.0 |  |  |  | 138172.063 |
| -39654900.0 |  |  |  | 138920.561 |
| -38959200.0 |  |  |  | 139660.764 |
| -38263500.0 |  |  |  | 140392.453 |
| -37567800.0 |  |  |  | 141115.411 |
| -36872100.0 |  |  |  | 141829.424 |
| -36176400.0 |  |  |  | 142534.277 |
| -35480700.0 |  |  |  | 143229.76 |
| -34785000.0 |  |  |  | 143915.661 |
| -34089300.0 |  |  |  | 144591.772 |
| -33393600.0 |  |  |  | 145257.887 |
| -32697900.0 |  |  |  | 145913.803 |
| -32002200.0 |  |  |  | 146559.316 |
| -31306500.0 |  |  |  | 147194.229 |
| -30610800.0 |  |  |  | 147818.343 |
| -29915100.0 |  |  |  | 148431.464 |
| -29219400.0 |  |  |  | 149033.4 |
| -28523700.0 |  |  |  | 149623.963 |
| -27828000.0 |  |  |  | 150202.966 |
| -27132300.0 |  |  |  | 150770.225 |
| -26436600.0 |  |  |  | 151325.562 |
| -25740900.0 |  |  |  | 151868.798 |
| -25045200.0 |  |  |  | 152399.76 |
| -24349500.0 |  |  |  | 152918.278 |
| -23653800.0 |  |  |  | 153424.184 |
| -22958100.0 |  |  |  | 153917.316 |
| -22262400.0 |  |  |  | 154397.514 |
| -21566700.0 |  |  |  | 154864.622 |
| -20871000.0 |  |  |  | 155318.488 |
| -20175300.0 |  |  |  | 155758.963 |
| -19479600.0 |  |  |  | 156185.904 |
| -18783900.0 |  |  |  | 156599.17 |
| -18088200.0 |  |  |  | 156998.625 |
| -17392500.0 |  |  |  | 157384.138 |
| -16696800.0 |  |  |  | 157755.582 |
| -16001100.0 |  |  |  | 158112.832 |
| -15305400.0 |  |  |  | 158455.772 |
| -14609700.0 |  |  |  | 158784.286 |
| -13914000.0 |  |  |  | 159098.265 |
| -13218300.0 |  |  |  | 159397.605 |
| -12522600.0 |  |  |  | 159682.205 |
| -11826900.0 |  |  |  | 159951.97 |
| -11131200.0 |  |  |  | 160206.81 |
| -10435500.0 |  |  |  | 160446.639 |
| -9739800.0 |  |  |  | 160671.376 |
| -9044100.0 |  |  |  | 160880.946 |
| -8348400.0 |  |  |  | 161075.278 |
| -7652700.0 |  |  |  | 161254.306 |
| -6957000.0 |  |  |  | 161417.971 |
| -6261300.0 |  |  |  | 161566.216 |
| -5565600.0 |  |  |  | 161698.991 |
| -4869900.0 |  |  |  | 161816.252 |
| -4174200.0 |  |  |  | 161917.959 |
| -3478500.0 |  |  |  | 162004.077 |
| -2782800.0 |  |  |  | 162074.578 |
| -2087100.0 |  |  |  | 162129.436 |
| -1391400.0 |  |  |  | 162168.634 |
| -695700.0 |  |  |  | 162192.158 |
| 0.0 |  |  |  | 1622 |
| 695700.0 |  |  |  | 162192.158 |
| 1391400.0 |  |  |  | 162168.634 |
| 2087100.0 |  |  |  | 162129.436 |
| 2782800.0 |  |  |  | 162074.578 |
| 3478500.0 |  |  |  | 162004.077 |
| 4174200.0 |  |  |  | 161917.959 |
| 4869900.0 |  |  |  | 161816.252 |
| 5565600.0 |  |  |  | 161698.991 |
| 6261300.0 |  |  |  | 161566.216 |
| 6957000.0 |  |  |  | 161417.971 |
| 7652700.0 |  |  |  | 161254.306 |
| 8348400.0 |  |  |  | 161075.278 |
| 9044100.0 |  |  |  | 160880.946 |
| 9739800.0 |  |  |  | 160671.376 |
| 10435500.0 |  |  |  | 160446.639 |
| 11131200.0 |  |  |  | 160206.81 |
| 11826900.0 |  |  |  | 159951.97 |
| 12522600.0 |  |  |  | 159682.205 |
| 13218300.0 |  |  |  | 159397.605 |
| 13914000.0 |  |  |  | 159098.265 |
| 14609700.0 |  |  |  | 158784.286 |
| 15305400.0 |  |  |  | 158455.772 |
| 16001100.0 |  |  |  | 158112.832 |
| 16696800.0 |  |  |  | 157755.582 |
| 17392500.0 |  |  |  | 157384.138 |
| 18088200.0 |  |  |  | 156998.625 |
| 18783900.0 |  |  |  | 156599.17 |
| 19479600.0 |  |  |  | 156185.904 |
| 20175300.0 |  |  |  | 155758.963 |
| 20871000.0 |  |  |  | 155318.488 |
| 21566700.0 |  |  |  | 154864.622 |
| 22262400.0 |  |  |  | 154397.514 |
| 22958100.0 |  |  |  | 153917.316 |
| 23653800.0 |  |  |  | 153424.184 |
| 24349500.0 |  |  |  | 152918.278 |
| 25045200.0 |  |  |  | 152399.76 |
| 25740900.0 |  |  |  | 151868.798 |
| 26436600.0 |  |  |  | 151325.562 |
| 27132300.0 |  |  |  | 150770.225 |
| 27828000.0 |  |  |  | 150202.966 |
| 28523700.0 |  |  |  | 149623.963 |
| 29219400.0 |  |  |  | 149033.4 |
| 29915100.0 |  |  |  | 148431.464 |
| 30610800.0 |  |  |  | 147818.343 |
| 31306500.0 |  |  |  | 147194.229 |
| 32002200.0 |  |  |  | 146559.316 |
| 32697900.0 |  |  |  | 145913.803 |
| 33393600.0 |  |  |  | 145257.887 |
| 34089300.0 |  |  |  | 144591.772 |
| 34785000.0 |  |  |  | 143915.661 |
| 35480700.0 |  |  |  | 143229.76 |
| 36176400.0 |  |  |  | 142534.277 |
| 36872100.0 |  |  |  | 141829.424 |
| 37567800.0 |  |  |  | 141115.411 |
| 38263500.0 |  |  |  | 140392.453 |
| 38959200.0 |  |  |  | 139660.764 |
| 39654900.0 |  |  |  | 138920.561 |
| 40350600.0 |  |  |  | 138172.063 |
| 41046300.0 |  |  |  | 137415.488 |
| 41742000.0 |  |  |  | 136651.057 |
| 42437700.0 |  |  |  | 135878.991 |
| 43133400.0 |  |  |  | 135099.513 |
| 43829100.0 |  |  |  | 134312.847 |
| 44524800.0 |  |  |  | 133519.215 |
| 45220500.0 |  |  |  | 132718.842 |
| 45916200.0 |  |  |  | 131911.953 |
| 46611900.0 |  |  |  | 131098.773 |
| 47307600.0 |  |  |  | 130279.529 |
| 48003300.0 |  |  |  | 129454.445 |
| 48699000.0 |  |  |  | 128623.747 |
| 49394700.0 |  |  |  | 127787.661 |
| 50090400.0 |  |  |  | 126946.412 |
| 50786100.0 |  |  |  | 126100.226 |
| 51481800.0 |  |  |  | 125249.328 |
| 52177500.0 |  |  |  | 124393.941 |
| 52873200.0 |  |  |  | 123534.29 |
| 53568900.0 |  |  |  | 122670.597 |
| 54264600.0 |  |  |  | 121803.086 |
| 54960300.0 |  |  |  | 120931.977 |
| 55656000.0 |  |  |  | 120057.491 |
| 56351700.0 |  |  |  | 119179.847 |
| 57047400.0 |  |  |  | 118299.264 |
| 57743100.0 |  |  |  | 117415.96 |
| 58438800.0 |  |  |  | 116530.148 |
| 59134500.0 |  |  |  | 115642.045 |
| 59830200.0 |  |  |  | 114751.862 |
| 60525900.0 |  |  |  | 113859.811 |
| 61221600.0 |  |  |  | 112966.101 |
| 61917300.0 |  |  |  | 112070.941 |
| 62613000.0 |  |  |  | 111174.536 |
| 63308700.0 |  |  |  | 110277.091 |
| 64004400.0 |  |  |  | 109378.807 |
| 64700100.0 |  |  |  | 108479.885 |
| 65395800.0 |  |  |  | 107580.522 |
| 66091500.0 |  |  |  | 106680.915 |
| 66787200.0 |  |  |  | 105781.257 |
| 67482900.0 |  |  |  | 104881.738 |
| 68178600.0 |  |  |  | 103982.549 |
| 68874300.0 |  |  |  | 103083.875 |
| 69570000.0 |  |  |  | 102185.9 |
| 70265700.0 |  |  |  | 101288.807 |
| 70961400.0 |  |  |  | 100392.772 |
| 71657100.0 |  |  |  | 99497.973 |
| 72352800.0 |  |  |  | 98604.583 |
| 73048500.0 |  |  |  | 97712.772 |
| 73744200.0 |  |  |  | 96822.709 |
| 74439900.0 |  |  |  | 95934.559 |
| 75135600.0 |  |  |  | 95048.483 |
| 75831300.0 |  |  |  | 94164.641 |
| 76527000.0 |  |  |  | 93283.19 |
| 77222700.0 |  |  |  | 92404.281 |
| 77918400.0 |  |  |  | 91528.067 |
| 78614100.0 |  |  |  | 90654.694 |
| 79309800.0 |  |  |  | 89784.306 |
| 80005500.0 |  |  |  | 88917.045 |
| 80701200.0 |  |  |  | 88053.048 |
| 81396900.0 |  |  |  | 87192.451 |
| 82092600.0 |  |  |  | 86335.384 |
| 82788300.0 |  |  |  | 85481.977 |
| 83484000.0 |  |  |  | 84632.355 |
| 84179700.0 |  |  |  | 83786.64 |
| 84875400.0 |  |  |  | 82944.951 |
| 85571100.0 |  |  |  | 82107.404 |
| 86266800.0 |  |  |  | 81274.111 |
| 86962500.0 |  |  |  | 80445.182 |
| 87658200.0 |  |  |  | 79620.722 |
| 88353900.0 |  |  |  | 78800.835 |
| 89049600.0 |  |  |  | 77985.621 |
| 89745300.0 |  |  |  | 77175.175 |
| 90441000.0 |  |  |  | 76369.591 |
| 91136700.0 |  |  |  | 75568.959 |
| 91832400.0 |  |  |  | 74773.366 |
| 92528100.0 |  |  |  | 73982.895 |
| 93223800.0 |  |  |  | 73197.627 |
| 93919500.0 |  |  |  | 72417.64 |
| 94615200.0 |  |  |  | 71643.006 |
| 95310900.0 |  |  |  | 70873.799 |
| 96006600.0 |  |  |  | 70110.085 |
| 96702300.0 |  |  |  | 69351.929 |
| 97398000.0 |  |  |  | 68599.394 |
| 98093700.0 |  |  |  | 67852.538 |
| 98789400.0 |  |  |  | 67111.417 |
| 99485100.0 |  |  |  | 66376.083 |
| 100180800.0 |  |  |  | 65646.587 |
| 100876500.0 |  |  |  | 64922.976 |
| 101572200.0 |  |  |  | 64205.293 |
| 102267900.0 |  |  |  | 63493.58 |
| 102963600.0 |  |  |  | 62787.875 |
| 103659300.0 |  |  |  | 62088.214 |
| 104355000.0 |  |  |  | 61394.629 |
| 105050700.0 |  |  |  | 60707.151 |
| 105746400.0 |  |  |  | 60025.807 |
| 106442100.0 |  |  |  | 59350.622 |
| 107137800.0 |  |  |  | 58681.618 |
| 107833500.0 |  |  |  | 58018.815 |
| 108529200.0 |  |  |  | 57362.229 |
| 109224900.0 |  |  |  | 56711.875 |
| 109920600.0 |  |  |  | 56067.765 |
| 110616300.0 |  |  |  | 55429.909 |
| 111312000.0 |  |  |  | 54798.315 |
| 112007700.0 |  |  |  | 54172.987 |
| 112703400.0 |  |  |  | 53553.928 |
| 113399100.0 |  |  |  | 52941.138 |
| 114094800.0 |  |  |  | 52334.617 |
| 114790500.0 |  |  |  | 51734.36 |
| 115486200.0 |  |  |  | 51140.36 |
| 116181900.0 |  |  |  | 50552.611 |
| 116877600.0 |  |  |  | 49971.103 |
| 117573300.0 |  |  |  | 49395.823 |
| 118269000.0 |  |  |  | 48826.757 |
| 118964700.0 |  |  |  | 48263.89 |
| 119660400.0 |  |  |  | 47707.205 |
| 120356100.0 |  |  |  | 47156.682 |
| 121051800.0 |  |  |  | 46612.301 |
| 121747500.0 |  |  |  | 46074.038 |
| 122443200.0 |  |  |  | 45541.869 |
| 123138900.0 |  |  |  | 45015.769 |
| 123834600.0 |  |  |  | 44495.711 |
| 124530300.0 |  |  |  | 43981.664 |
| 125226000.0 |  |  |  | 43473.6 |
| 125921700.0 |  |  |  | 42971.487 |
| 126617400.0 |  |  |  | 42475.29 |
| 127313100.0 |  |  |  | 41984.977 |
| 128008800.0 |  |  |  | 41500.512 |
| 128704500.0 |  |  |  | 41021.857 |
| 129400200.0 |  |  |  | 40548.976 |
| 130095900.0 |  |  |  | 40081.829 |
| 130791600.0 |  |  |  | 39620.375 |
| 131487300.0 |  |  |  | 39164.575 |
| 132183000.0 |  |  |  | 38714.385 |
| 132878700.0 |  |  |  | 38269.763 |
| 133574400.0 |  |  |  | 37830.665 |
| 134270100.0 |  |  |  | 37397.047 |
| 134965800.0 |  |  |  | 36968.862 |
| 135661500.0 |  |  |  | 36546.064 |
| 136357200.0 |  |  |  | 36128.607 |
| 137052900.0 |  |  |  | 35716.442 |
| 137748600.0 |  |  |  | 35309.522 |
| 138444300.0 |  |  |  | 34907.797 |
| 139140000.0 |  |  |  | 34511.218 |
| 139835700.0 |  |  |  | 34119.735 |
| 140531400.0 |  |  |  | 33733.297 |
| 141227100.0 |  |  |  | 33351.854 |
| 141922800.0 |  |  |  | 32975.353 |
| 142618500.0 |  |  |  | 32603.744 |
| 143314200.0 |  |  |  | 32236.974 |
| 144009900.0 |  |  |  | 31874.991 |
| 144705600.0 |  |  |  | 31517.742 |
| 145401300.0 |  |  |  | 31165.174 |
| 146097000.0 |  |  |  | 30817.234 |
| 146792700.0 |  |  |  | 30473.87 |
| 147488400.0 |  |  |  | 30135.026 |
| 148184100.0 |  |  |  | 29800.65 |
| 148879800.0 |  |  |  | 29470.689 |
| 149575500.0 |  |  |  | 29145.088 |
| 150271200.0 |  |  |  | 28823.793 |
| 150966900.0 |  |  |  | 28506.752 |
| 151662600.0 |  |  |  | 28193.91 |
| 152358300.0 |  |  |  | 27885.214 |
| 153054000.0 |  |  |  | 27580.61 |
| 153749700.0 |  |  |  | 27280.044 |
| 154445400.0 |  |  |  | 26983.464 |
| 155141100.0 |  |  |  | 26690.817 |
| 155836800.0 |  |  |  | 26402.048 |
| 156532500.0 |  |  |  | 26117.105 |
| 157228200.0 |  |  |  | 25835.937 |
| 157923900.0 |  |  |  | 25558.489 |
| 158619600.0 |  |  |  | 25284.711 |
| 159315300.0 |  |  |  | 25014.55 |
| 160011000.0 |  |  |  | 24747.955 |
| 160706700.0 |  |  |  | 24484.874 |
| 161402400.0 |  |  |  | 24225.257 |
| 162098100.0 |  |  |  | 23969.053 |
| 162793800.0 |  |  |  | 23716.211 |
| 163489500.0 |  |  |  | 23466.683 |
| 164185200.0 |  |  |  | 23220.417 |
| 164880900.0 |  |  |  | 22977.366 |
| 165576600.0 |  |  |  | 22737.481 |
| 166272300.0 |  |  |  | 22500.713 |
| 166968000.0 |  |  |  | 22267.015 |
| 167663700.0 |  |  |  | 22036.338 |
| 168359400.0 |  |  |  | 21808.637 |
| 169055100.0 |  |  |  | 21583.865 |
| 169750800.0 |  |  |  | 21361.975 |
| 170446500.0 |  |  |  | 21142.923 |
| 171142200.0 |  |  |  | 20926.663 |
| 171837900.0 |  |  |  | 20713.151 |
| 172533600.0 |  |  |  | 20502.343 |
| 173229300.0 |  |  |  | 20294.195 |
| 173925000.0 |  |  |  | 20088.664 |
| 174620700.0 |  |  |  | 19885.708 |
| 175316400.0 |  |  |  | 19685.285 |
| 176012100.0 |  |  |  | 19487.353 |
| 176707800.0 |  |  |  | 19291.872 |
| 177403500.0 |  |  |  | 19098.801 |
| 178099200.0 |  |  |  | 18908.101 |
| 178794900.0 |  |  |  | 18719.733 |
| 179490600.0 |  |  |  | 18533.657 |
| 180186300.0 |  |  |  | 18349.835 |
| 180882000.0 |  |  |  | 18168.23 |
| 181577700.0 |  |  |  | 17988.805 |
| 182273400.0 |  |  |  | 17811.524 |
| 182969100.0 |  |  |  | 17636.35 |
| 183664800.0 |  |  |  | 17463.248 |
| 184360500.0 |  |  |  | 17292.184 |
| 185056200.0 |  |  |  | 17123.122 |
| 185751900.0 |  |  |  | 16956.03 |
| 186447600.0 |  |  |  | 16790.874 |
| 187143300.0 |  |  |  | 16627.621 |
| 187839000.0 |  |  |  | 16466.24 |
| 188534700.0 |  |  |  | 16306.698 |
| 189230400.0 |  |  |  | 16148.965 |
| 189926100.0 |  |  |  | 15993.011 |
| 190621800.0 |  |  |  | 15838.805 |
| 191317500.0 |  |  |  | 15686.318 |
| 192013200.0 |  |  |  | 15535.521 |
| 192708900.0 |  |  |  | 15386.386 |
| 193404600.0 |  |  |  | 15238.885 |
| 194100300.0 |  |  |  | 15092.991 |
| 194796000.0 |  |  |  | 14948.676 |
| 195491700.0 |  |  |  | 14805.915 |
| 196187400.0 |  |  |  | 14664.681 |
| 196883100.0 |  |  |  | 14524.95 |
| 197578800.0 |  |  |  | 14386.696 |
| 198274500.0 |  |  |  | 14249.896 |
| 198970200.0 |  |  |  | 14114.525 |
| 199665900.0 |  |  |  | 13980.56 |
| 200361600.0 |  |  |  | 13847.978 |
| 201057300.0 |  |  |  | 13716.756 |
| 201753000.0 |  |  |  | 13586.873 |
| 202448700.0 |  |  |  | 13458.308 |
| 203144400.0 |  |  |  | 13331.038 |
| 203840100.0 |  |  |  | 13205.043 |
| 204535800.0 |  |  |  | 13080.304 |
| 205231500.0 |  |  |  | 12956.8 |
| 205927200.0 |  |  |  | 12834.512 |
| 206622900.0 |  |  |  | 12713.421 |
| 207318600.0 |  |  |  | 12593.509 |
| 208014300.0 |  |  |  | 12474.757 |
| 208710000.0 |  |  |  | 12357.147 |
| 209405700.0 |  |  |  | 12240.662 |
| 210101400.0 |  |  |  | 12125.286 |
| 210797100.0 |  |  |  | 12011.002 |
| 211492800.0 |  |  |  | 11897.793 |
| 212188500.0 |  |  |  | 11785.643 |
| 212884200.0 |  |  |  | 11674.538 |
| 213579900.0 |  |  |  | 11564.461 |
| 214275600.0 |  |  |  | 11455.399 |
| 214971300.0 |  |  |  | 11347.336 |
| 215667000.0 |  |  |  | 11240.259 |
| 216362700.0 |  |  |  | 11134.153 |
| 217058400.0 |  |  |  | 11029.006 |
| 217754100.0 |  |  |  | 10924.803 |
| 218449800.0 |  |  |  | 10821.533 |
| 219145500.0 |  |  |  | 10719.182 |
| 219841200.0 |  |  |  | 10617.739 |
| 220536900.0 |  |  |  | 10517.19 |
| 221232600.0 |  |  |  | 10417.526 |
| 221928300.0 |  |  |  | 10318.733 |
| 222624000.0 |  |  |  | 10220.802 |
| 223319700.0 |  |  |  | 10123.72 |
| 224015400.0 |  |  |  | 10027.478 |
| 224711100.0 |  |  |  | 9932.065 |
| 225406800.0 |  |  |  | 9837.471 |
| 226102500.0 |  |  |  | 9743.686 |
| 226798200.0 |  |  |  | 9650.701 |
| 227493900.0 |  |  |  | 9558.505 |
| 228189600.0 |  |  |  | 9467.09 |
| 228885300.0 |  |  |  | 9376.446 |
| 229581000.0 |  |  |  | 9286.566 |
| 230276700.0 |  |  |  | 9197.439 |
| 230972400.0 |  |  |  | 9109.059 |
| 231668100.0 |  |  |  | 9021.416 |
| 232363800.0 |  |  |  | 8934.504 |
| 233059500.0 |  |  |  | 8848.313 |
| 233755200.0 |  |  |  | 8762.836 |
| 234450900.0 |  |  |  | 8678.067 |
| 235146600.0 |  |  |  | 8593.997 |
| 235842300.0 |  |  |  | 8510.619 |
| 236538000.0 |  |  |  | 8427.927 |
| 237233700.0 |  |  |  | 8345.914 |
| 237929400.0 |  |  |  | 8264.574 |
| 238625100.0 |  |  |  | 8183.899 |
| 239320800.0 |  |  |  | 8103.883 |
| 240016500.0 |  |  |  | 8024.521 |
| 240712200.0 |  |  |  | 7945.806 |
| 241407900.0 |  |  |  | 7867.732 |
| 242103600.0 |  |  |  | 7790.293 |
| 242799300.0 |  |  |  | 7713.485 |
| 243495000.0 |  |  |  | 7637.3 |
| 244190700.0 |  |  |  | 7561.735 |
| 244886400.0 |  |  |  | 7486.783 |
| 245582100.0 |  |  |  | 7412.44 |
| 246277800.0 |  |  |  | 7338.7 |
| 246973500.0 |  |  |  | 7265.558 |
| 247669200.0 |  |  |  | 7193.01 |
| 248364900.0 |  |  |  | 7121.05 |
| 249060600.0 |  |  |  | 7049.675 |
| 249756300.0 |  |  |  | 6978.878 |
| 250452000.0 |  |  |  | 6908.657 |
| 251147700.0 |  |  |  | 6839.006 |
| 251843400.0 |  |  |  | 6769.922 |
| 252539100.0 |  |  |  | 6701.399 |
| 253234800.0 |  |  |  | 6633.434 |
| 253930500.0 |  |  |  | 6566.022 |
| 254626200.0 |  |  |  | 6499.16 |
| 255321900.0 |  |  |  | 6432.844 |
| 256017600.0 |  |  |  | 6367.069 |
| 256713300.0 |  |  |  | 6301.832 |
| 257409000.0 |  |  |  | 6237.129 |
| 258104700.0 |  |  |  | 6172.957 |
| 258800400.0 |  |  |  | 6109.311 |
| 259496100.0 |  |  |  | 6046.189 |
| 260191800.0 |  |  |  | 5983.586 |
| 260887500.0 |  |  |  | 5921.499 |
| 261583200.0 |  |  |  | 5859.925 |
| 262278900.0 |  |  |  | 5798.86 |
| 262974600.0 |  |  |  | 5738.301 |
| 263670300.0 |  |  |  | 5678.244 |
| 264366000.0 |  |  |  | 5618.687 |
| 265061700.0 |  |  |  | 5559.626 |
| 265757400.0 |  |  |  | 5501.058 |
| 266453100.0 |  |  |  | 5442.98 |
| 267148800.0 |  |  |  | 5385.388 |
| 267844500.0 |  |  |  | 5328.281 |
| 268540200.0 |  |  |  | 5271.653 |
| 269235900.0 |  |  |  | 5215.504 |
| 269931600.0 |  |  |  | 5159.829 |
| 270627300.0 |  |  |  | 5104.625 |
| 271323000.0 |  |  |  | 5049.89 |
| 272018700.0 |  |  |  | 4995.622 |
| 272714400.0 |  |  |  | 4941.816 |
| 273410100.0 |  |  |  | 4888.47 |
| 274105800.0 |  |  |  | 4835.582 |
| 274801500.0 |  |  |  | 4783.148 |
| 275497200.0 |  |  |  | 4731.166 |
| 276192900.0 |  |  |  | 4679.633 |
| 276888600.0 |  |  |  | 4628.547 |
| 277584300.0 |  |  |  | 4577.904 |
| 278280000.0 |  |  |  | 4527.701 |
| 278975700.0 |  |  |  | 4477.938 |
| 279671400.0 |  |  |  | 4428.609 |
| 280367100.0 |  |  |  | 4379.714 |
| 281062800.0 |  |  |  | 4331.249 |
| 281758500.0 |  |  |  | 4283.211 |
| 282454200.0 |  |  |  | 4235.599 |
| 283149900.0 |  |  |  | 4188.409 |
| 283845600.0 |  |  |  | 4141.639 |
| 284541300.0 |  |  |  | 4095.287 |
| 285237000.0 |  |  |  | 4049.349 |
| 285932700.0 |  |  |  | 4003.824 |
| 286628400.0 |  |  |  | 3958.708 |
| 287324100.0 |  |  |  | 3914 |
| 288019800.0 |  |  |  | 3869.696 |
| 288715500.0 |  |  |  | 3825.795 |
| 289411200.0 |  |  |  | 3782.293 |
| 290106900.0 |  |  |  | 3739.189 |
| 290802600.0 |  |  |  | 3696.48 |
| 291498300.0 |  |  |  | 3654.163 |
| 292194000.0 |  |  |  | 3612.236 |
| 292889700.0 |  |  |  | 3570.696 |
| 293585400.0 |  |  |  | 3529.542 |
| 294281100.0 |  |  |  | 3488.77 |
| 294976800.0 |  |  |  | 3448.379 |
| 295672500.0 |  |  |  | 3408.365 |
| 296368200.0 |  |  |  | 3368.726 |
| 297063900.0 |  |  |  | 3329.461 |
| 297759600.0 |  |  |  | 3290.566 |
| 298455300.0 |  |  |  | 3252.039 |
| 299151000.0 |  |  |  | 3213.879 |
| 299846700.0 |  |  |  | 3176.081 |
| 300542400.0 |  |  |  | 3138.645 |
| 301238100.0 |  |  |  | 3101.567 |
| 301933800.0 |  |  |  | 3064.846 |
| 302629500.0 |  |  |  | 3028.479 |
| 303325200.0 |  |  |  | 2992.463 |
| 304020900.0 |  |  |  | 2956.797 |
| 304716600.0 |  |  |  | 2921.477 |
| 305412300.0 |  |  |  | 2886.503 |
| 306108000.0 |  |  |  | 2851.87 |
| 306803700.0 |  |  |  | 2817.578 |
| 307499400.0 |  |  |  | 2783.623 |
| 308195100.0 |  |  |  | 2750.003 |
| 308890800.0 |  |  |  | 2716.717 |
| 309586500.0 |  |  |  | 2683.761 |
| 310282200.0 |  |  |  | 2651.133 |
| 310977900.0 |  |  |  | 2618.832 |
| 311673600.0 |  |  |  | 2586.855 |
| 312369300.0 |  |  |  | 2555.199 |
| 313065000.0 |  |  |  | 2523.862 |
| 313760700.0 |  |  |  | 2492.842 |
| 314456400.0 |  |  |  | 2462.137 |
| 315152100.0 |  |  |  | 2431.745 |
| 315847800.0 |  |  |  | 2401.663 |
| 316543500.0 |  |  |  | 2371.888 |
| 317239200.0 |  |  |  | 2342.419 |
| 317934900.0 |  |  |  | 2313.254 |
| 318630600.0 |  |  |  | 2284.39 |
| 319326300.0 |  |  |  | 2255.825 |
| 320022000.0 |  |  |  | 2227.557 |
| 320717700.0 |  |  |  | 2199.583 |
| 321413400.0 |  |  |  | 2171.902 |
| 322109100.0 |  |  |  | 2144.511 |
| 322804800.0 |  |  |  | 2117.407 |
| 323500500.0 |  |  |  | 2090.59 |
| 324196200.0 |  |  |  | 2064.056 |
| 324891900.0 |  |  |  | 2037.803 |
| 325587600.0 |  |  |  | 2011.829 |
| 326283300.0 |  |  |  | 1986.133 |
| 326979000.0 |  |  |  | 1960.711 |
| 327674700.0 |  |  |  | 1935.562 |
| 328370400.0 |  |  |  | 1910.684 |
| 329066100.0 |  |  |  | 1886.074 |
| 329761800.0 |  |  |  | 1861.73 |
| 330457500.0 |  |  |  | 1837.65 |
| 331153200.0 |  |  |  | 1813.832 |
| 331848900.0 |  |  |  | 1790.274 |
| 332544600.0 |  |  |  | 1766.974 |
| 333240300.0 |  |  |  | 1743.93 |
| 333936000.0 |  |  |  | 1721.139 |
| 334631700.0 |  |  |  | 1698.599 |
| 335327400.0 |  |  |  | 1676.309 |
| 336023100.0 |  |  |  | 1654.267 |
| 336718800.0 |  |  |  | 1632.469 |
| 337414500.0 |  |  |  | 1610.915 |
| 338110200.0 |  |  |  | 1589.602 |
| 338805900.0 |  |  |  | 1568.528 |
| 339501600.0 |  |  |  | 1547.691 |
| 340197300.0 |  |  |  | 1527.089 |
| 340893000.0 |  |  |  | 1506.72 |
| 341588700.0 |  |  |  | 1486.583 |
| 342284400.0 |  |  |  | 1466.674 |
| 342980100.0 |  |  |  | 1446.992 |
| 343675800.0 |  |  |  | 1427.536 |
| 344371500.0 |  |  |  | 1408.302 |
| 345067200.0 |  |  |  | 1389.29 |
| 345762900.0 |  |  |  | 1370.496 |
| 346458600.0 |  |  |  | 1351.921 |
| 347154300.0 |  |  |  | 1333.56 |
| 347850000.0 |  |  |  | 1315.412 |
| 348545700.0 |  |  |  | 1297.477 |
| 349241400.0 |  |  |  | 1279.75 |
| 349937100.0 |  |  |  | 1262.231 |
| 350632800.0 |  |  |  | 1244.918 |
| 351328500.0 |  |  |  | 1227.809 |
| 352024200.0 |  |  |  | 1210.902 |
| 352719900.0 |  |  |  | 1194.195 |
| 353415600.0 |  |  |  | 1177.686 |
| 354111300.0 |  |  |  | 1161.373 |
| 354807000.0 |  |  |  | 1145.256 |
| 355502700.0 |  |  |  | 1129.33 |
| 356198400.0 |  |  |  | 1113.596 |
| 356894100.0 |  |  |  | 1098.051 |
| 357589800.0 |  |  |  | 1082.693 |
| 358285500.0 |  |  |  | 1067.521 |
| 358981200.0 |  |  |  | 1052.533 |
| 359676900.0 |  |  |  | 1037.726 |
| 360372600.0 |  |  |  | 1023.1 |
| 361068300.0 |  |  |  | 1008.652 |
| 361764000.0 |  |  |  | 994.381 |
| 362459700.0 |  |  |  | 980.286 |
| 363155400.0 |  |  |  | 966.363 |
| 363851100.0 |  |  |  | 952.612 |
| 364546800.0 |  |  |  | 939.031 |
| 365242500.0 |  |  |  | 925.618 |
| 365938200.0 |  |  |  | 912.372 |
| 366633900.0 |  |  |  | 899.291 |
| 367329600.0 |  |  |  | 886.373 |
| 368025300.0 |  |  |  | 873.616 |
| 368721000.0 |  |  |  | 861.02 |
| 369416700.0 |  |  |  | 848.582 |
| 370112400.0 |  |  |  | 836.3 |
| 370808100.0 |  |  |  | 824.174 |
| 371503800.0 |  |  |  | 812.202 |
| 372199500.0 |  |  |  | 800.381 |
| 372895200.0 |  |  |  | 788.711 |
| 373590900.0 |  |  |  | 777.189 |
| 374286600.0 |  |  |  | 765.815 |
| 374982300.0 |  |  |  | 754.587 |
| 375678000.0 |  |  |  | 743.502 |
| 376373700.0 |  |  |  | 732.561 |
| 377069400.0 |  |  |  | 721.761 |
| 377765100.0 |  |  |  | 711.1 |
| 378460800.0 |  |  |  | 700.578 |
| 379156500.0 |  |  |  | 690.192 |
| 379852200.0 |  |  |  | 679.942 |
| 380547900.0 |  |  |  | 669.826 |
| 381243600.0 |  |  |  | 659.842 |
| 381939300.0 |  |  |  | 649.989 |
| 382635000.0 |  |  |  | 640.266 |
| 383330700.0 |  |  |  | 630.67 |
| 384026400.0 |  |  |  | 621.202 |
| 384722100.0 |  |  |  | 611.859 |
| 385417800.0 |  |  |  | 602.64 |
| 386113500.0 |  |  |  | 593.543 |
| 386809200.0 |  |  |  | 584.568 |
| 387504900.0 |  |  |  | 575.713 |
| 388200600.0 |  |  |  | 566.976 |
| 388896300.0 |  |  |  | 558.356 |
| 389592000.0 |  |  |  | 549.853 |
| 390287700.0 |  |  |  | 541.464 |
| 390983400.0 |  |  |  | 533.188 |
| 391679100.0 |  |  |  | 525.025 |
| 392374800.0 |  |  |  | 516.972 |
| 393070500.0 |  |  |  | 509.029 |
| 393766200.0 |  |  |  | 501.194 |
| 394461900.0 |  |  |  | 493.466 |
| 395157600.0 |  |  |  | 485.844 |
| 395853300.0 |  |  |  | 478.327 |
| 396549000.0 |  |  |  | 470.913 |
| 397244700.0 |  |  |  | 463.601 |
| 397940400.0 |  |  |  | 456.39 |
| 398636100.0 |  |  |  | 449.279 |
| 399331800.0 |  |  |  | 442.267 |
| 400027500.0 |  |  |  | 435.352 |
| 400723200.0 |  |  |  | 428.534 |
| 401418900.0 |  |  |  | 421.81 |
| 402114600.0 |  |  |  | 415.181 |
| 402810300.0 |  |  |  | 408.645 |
| 403506000.0 |  |  |  | 402.201 |
| 404201700.0 |  |  |  | 395.847 |
| 404897400.0 |  |  |  | 389.583 |
| 405593100.0 |  |  |  | 383.408 |
| 406288800.0 |  |  |  | 377.32 |
| 406984500.0 |  |  |  | 371.319 |
| 407680200.0 |  |  |  | 365.403 |
| 408375900.0 |  |  |  | 359.571 |
| 409071600.0 |  |  |  | 353.823 |
| 409767300.0 |  |  |  | 348.157 |
| 410463000.0 |  |  |  | 342.572 |
| 411158700.0 |  |  |  | 337.068 |
| 411854400.0 |  |  |  | 331.643 |
| 412550100.0 |  |  |  | 326.297 |
| 413245800.0 |  |  |  | 321.028 |
| 413941500.0 |  |  |  | 315.835 |
| 414637200.0 |  |  |  | 310.718 |
| 415332900.0 |  |  |  | 305.675 |
| 416028600.0 |  |  |  | 300.706 |
| 416724300.0 |  |  |  | 295.809 |
| 417420000.0 |  |  |  | 290.984 |
| 418115700.0 |  |  |  | 286.23 |
| 418811400.0 |  |  |  | 281.546 |
| 419507100.0 |  |  |  | 276.931 |
| 420202800.0 |  |  |  | 272.384 |
| 420898500.0 |  |  |  | 267.905 |
| 421594200.0 |  |  |  | 263.492 |
| 422289900.0 |  |  |  | 259.144 |
| 422985600.0 |  |  |  | 254.861 |
| 423681300.0 |  |  |  | 250.642 |
| 424377000.0 |  |  |  | 246.487 |
| 425072700.0 |  |  |  | 242.393 |
| 425768400.0 |  |  |  | 238.361 |
| 426464100.0 |  |  |  | 234.389 |
| 427159800.0 |  |  |  | 230.478 |
| 427855500.0 |  |  |  | 226.625 |
| 428551200.0 |  |  |  | 222.831 |
| 429246900.0 |  |  |  | 219.094 |
| 429942600.0 |  |  |  | 215.414 |
| 430638300.0 |  |  |  | 211.789 |
| 431334000.0 |  |  |  | 208.22 |
| 432029700.0 |  |  |  | 204.706 |
| 432725400.0 |  |  |  | 201.246 |
| 433421100.0 |  |  |  | 197.838 |
| 434116800.0 |  |  |  | 194.483 |
| 434812500.0 |  |  |  | 191.179 |
| 435508200.0 |  |  |  | 187.927 |
| 436203900.0 |  |  |  | 184.724 |
| 436899600.0 |  |  |  | 181.572 |
| 437595300.0 |  |  |  | 178.468 |
| 438291000.0 |  |  |  | 175.412 |
| 438986700.0 |  |  |  | 172.404 |
| 439682400.0 |  |  |  | 169.443 |
| 440378100.0 |  |  |  | 166.528 |
| 441073800.0 |  |  |  | 163.659 |
| 441769500.0 |  |  |  | 160.835 |
| 442465200.0 |  |  |  | 158.055 |
| 443160900.0 |  |  |  | 155.319 |
| 443856600.0 |  |  |  | 152.626 |
| 444552300.0 |  |  |  | 149.976 |
| 445248000.0 |  |  |  | 147.367 |
| 445943700.0 |  |  |  | 144.8 |
| 446639400.0 |  |  |  | 142.274 |
| 447335100.0 |  |  |  | 139.788 |
| 448030800.0 |  |  |  | 137.342 |
| 448726500.0 |  |  |  | 134.935 |
| 449422200.0 |  |  |  | 132.566 |
| 450117900.0 |  |  |  | 130.235 |
| 450813600.0 |  |  |  | 127.942 |
| 451509300.0 |  |  |  | 125.686 |
| 452205000.0 |  |  |  | 123.466 |
| 452900700.0 |  |  |  | 121.282 |
| 453596400.0 |  |  |  | 119.133 |
| 454292100.0 |  |  |  | 117.019 |
| 454987800.0 |  |  |  | 114.94 |
| 455683500.0 |  |  |  | 112.894 |
| 456379200.0 |  |  |  | 110.882 |
| 457074900.0 |  |  |  | 108.902 |
| 457770600.0 |  |  |  | 106.955 |
| 458466300.0 |  |  |  | 105.04 |
| 459162000.0 |  |  |  | 103.156 |
| 459857700.0 |  |  |  | 101.304 |
| 460553400.0 |  |  |  | 99.481 |
| 461249100.0 |  |  |  | 97.689 |
| 461944800.0 |  |  |  | 95.927 |
| 462640500.0 |  |  |  | 94.194 |
| 463336200.0 |  |  |  | 92.489 |
| 464031900.0 |  |  |  | 90.813 |
| 464727600.0 |  |  |  | 89.165 |
| 465423300.0 |  |  |  | 87.544 |
| 466119000.0 |  |  |  | 85.95 |
| 466814700.0 |  |  |  | 84.383 |
| 467510400.0 |  |  |  | 82.843 |
| 468206100.0 |  |  |  | 81.328 |
| 468901800.0 |  |  |  | 79.838 |
| 469597500.0 |  |  |  | 78.374 |
| 470293200.0 |  |  |  | 76.935 |
| 470988900.0 |  |  |  | 75.52 |
| 471684600.0 |  |  |  | 74.128 |
| 472380300.0 |  |  |  | 72.761 |
| 473076000.0 |  |  |  | 71.417 |
| 473771700.0 |  |  |  | 70.095 |
| 474467400.0 |  |  |  | 68.796 |
| 475163100.0 |  |  |  | 67.52 |
| 475858800.0 |  |  |  | 66.265 |
| 476554500.0 |  |  |  | 65.032 |
| 477250200.0 |  |  |  | 63.82 |
| 477945900.0 |  |  |  | 62.628 |
| 478641600.0 |  |  |  | 61.458 |
| 479337300.0 |  |  |  | 60.307 |
| 480033000.0 |  |  |  | 59.177 |
| 480728700.0 |  |  |  | 58.066 |
| 481424400.0 |  |  |  | 56.974 |
| 482120100.0 |  |  |  | 55.901 |
| 482815800.0 |  |  |  | 54.847 |
| 483511500.0 |  |  |  | 53.811 |
| 484207200.0 |  |  |  | 52.794 |
| 484902900.0 |  |  |  | 51.794 |
| 485598600.0 |  |  |  | 50.812 |
| 486294300.0 |  |  |  | 49.847 |
| 486990000.0 |  |  |  | 48.899 |
| 487685700.0 |  |  |  | 47.967 |
| 488381400.0 |  |  |  | 47.052 |
| 489077100.0 |  |  |  | 46.153 |
| 489772800.0 |  |  |  | 45.271 |
| 490468500.0 |  |  |  | 44.403 |
| 491164200.0 |  |  |  | 43.552 |
| 491859900.0 |  |  |  | 42.715 |
| 492555600.0 |  |  |  | 41.893 |
| 493251300.0 |  |  |  | 41.086 |
| 493947000.0 |  |  |  | 40.294 |
| 494642700.0 |  |  |  | 39.515 |
| 495338400.0 |  |  |  | 38.751 |
| 496034100.0 |  |  |  | 38 |
| 496729800.0 |  |  |  | 37.263 |
| 497425500.0 |  |  |  | 36.539 |
| 498121200.0 |  |  |  | 35.828 |
| 498816900.0 |  |  |  | 35.13 |
| 499512600.0 |  |  |  | 34.444 |
| 500208300.0 |  |  |  | 33.771 |
| 500904000.0 |  |  |  | 33.11 |
| 501599700.0 |  |  |  | 32.462 |
| 502295400.0 |  |  |  | 31.825 |
| 502991100.0 |  |  |  | 31.199 |
| 503686800.0 |  |  |  | 30.585 |
| 504382500.0 |  |  |  | 29.983 |
| 505078200.0 |  |  |  | 29.391 |
| 505773900.0 |  |  |  | 28.81 |
| 506469600.0 |  |  |  | 28.24 |
| 507165300.0 |  |  |  | 27.681 |
| 507861000.0 |  |  |  | 27.132 |
| 508556700.0 |  |  |  | 26.593 |
| 509252400.0 |  |  |  | 26.063 |
| 509948100.0 |  |  |  | 25.544 |
| 510643800.0 |  |  |  | 25.035 |
| 511339500.0 |  |  |  | 24.534 |
| 512035200.0 |  |  |  | 24.044 |
| 512730900.0 |  |  |  | 23.562 |
| 513426600.0 |  |  |  | 23.089 |
| 514122300.0 |  |  |  | 22.625 |
| 514818000.0 |  |  |  | 22.17 |
| 515513700.0 |  |  |  | 21.723 |
| 516209400.0 |  |  |  | 21.285 |
| 516905100.0 |  |  |  | 20.855 |
| 517600800.0 |  |  |  | 20.433 |
| 518296500.0 |  |  |  | 20.019 |
| 518992200.0 |  |  |  | 19.613 |
| 519687900.0 |  |  |  | 19.215 |
| 520383600.0 |  |  |  | 18.824 |
| 521079300.0 |  |  |  | 18.441 |
| 521775000.0 |  |  |  | 18.065 |
| 522470700.0 |  |  |  | 17.696 |
| 523166400.0 |  |  |  | 17.334 |
| 523862100.0 |  |  |  | 16.979 |
| 524557800.0 |  |  |  | 16.63 |
| 525253500.0 |  |  |  | 16.289 |
| 525949200.0 |  |  |  | 15.954 |
| 526644900.0 |  |  |  | 15.625 |
| 527340600.0 |  |  |  | 15.303 |
| 528036300.0 |  |  |  | 14.987 |
| 528732000.0 |  |  |  | 14.677 |
| 529427700.0 |  |  |  | 14.373 |
| 530123400.0 |  |  |  | 14.075 |
| 530819100.0 |  |  |  | 13.783 |
| 531514800.0 |  |  |  | 13.497 |
| 532210500.0 |  |  |  | 13.216 |
| 532906200.0 |  |  |  | 12.94 |
| 533601900.0 |  |  |  | 12.67 |
| 534297600.0 |  |  |  | 12.405 |
| 534993300.0 |  |  |  | 12.145 |
| 535689000.0 |  |  |  | 11.891 |
| 536384700.0 |  |  |  | 11.641 |
| 537080400.0 |  |  |  | 11.397 |
| 537776100.0 |  |  |  | 11.157 |
| 538471800.0 |  |  |  | 10.922 |
| 539167500.0 |  |  |  | 10.691 |
| 539863200.0 |  |  |  | 10.465 |
| 540558900.0 |  |  |  | 10.244 |
| 541254600.0 |  |  |  | 10.027 |
| 541950300.0 |  |  |  | 9.814 |
| 542646000.0 |  |  |  | 9.605 |
| 543341700.0 |  |  |  | 9.401 |
| 544037400.0 |  |  |  | 9.201 |
| 544733100.0 |  |  |  | 9.004 |
| 545428800.0 |  |  |  | 8.812 |
| 546124500.0 |  |  |  | 8.623 |
| 546820200.0 |  |  |  | 8.439 |
| 547515900.0 |  |  |  | 8.258 |
| 548211600.0 |  |  |  | 8.08 |
| 548907300.0 |  |  |  | 7.906 |
| 549603000.0 |  |  |  | 7.736 |
| 550298700.0 |  |  |  | 7.569 |
| 550994400.0 |  |  |  | 7.406 |
| 551690100.0 |  |  |  | 7.245 |
| 552385800.0 |  |  |  | 7.089 |
| 553081500.0 |  |  |  | 6.935 |
| 553777200.0 |  |  |  | 6.784 |
| 554472900.0 |  |  |  | 6.637 |
| 555168600.0 |  |  |  | 6.492 |
| 555864300.0 |  |  |  | 6.35 |
| 556560000.0 |  |  |  | 6.212 |
| 557255700.0 |  |  |  | 6.076 |
| 557951400.0 |  |  |  | 5.943 |
| 558647100.0 |  |  |  | 5.812 |
| 559342800.0 |  |  |  | 5.685 |
| 560038500.0 |  |  |  | 5.56 |
| 560734200.0 |  |  |  | 5.437 |
| 561429900.0 |  |  |  | 5.317 |
| 562125600.0 |  |  |  | 5.2 |
| 562821300.0 |  |  |  | 5.085 |
| 563517000.0 |  |  |  | 4.972 |
| 564212700.0 |  |  |  | 4.862 |
| 564908400.0 |  |  |  | 4.754 |
| 565604100.0 |  |  |  | 4.648 |
| 566299800.0 |  |  |  | 4.545 |
| 566995500.0 |  |  |  | 4.443 |
| 567691200.0 |  |  |  | 4.344 |
| 568386900.0 |  |  |  | 4.247 |
| 569082600.0 |  |  |  | 4.152 |
| 569778300.0 |  |  |  | 4.058 |
| 570474000.0 |  |  |  | 3.967 |
| 571169700.0 |  |  |  | 3.878 |
| 571865400.0 |  |  |  | 3.791 |
| 572561100.0 |  |  |  | 3.705 |
| 573256800.0 |  |  |  | 3.621 |
| 573952500.0 |  |  |  | 3.539 |
| 574648200.0 |  |  |  | 3.459 |
| 575343900.0 |  |  |  | 3.38 |
| 576039600.0 |  |  |  | 3.304 |
| 576735300.0 |  |  |  | 3.228 |
| 577431000.0 |  |  |  | 3.155 |
| 578126700.0 |  |  |  | 3.083 |
| 578822400.0 |  |  |  | 3.012 |
| 579518100.0 |  |  |  | 2.943 |
| 580213800.0 |  |  |  | 2.876 |
| 580909500.0 |  |  |  | 2.81 |
| 581605200.0 |  |  |  | 2.745 |
| 582300900.0 |  |  |  | 2.682 |
| 582996600.0 |  |  |  | 2.62 |
| 583692300.0 |  |  |  | 2.559 |
| 584388000.0 |  |  |  | 2.5 |
| 585083700.0 |  |  |  | 2.442 |
| 585779400.0 |  |  |  | 2.385 |
| 586475100.0 |  |  |  | 2.33 |
| 587170800.0 |  |  |  | 2.275 |
| 587866500.0 |  |  |  | 2.222 |
| 588562200.0 |  |  |  | 2.17 |
| 589257900.0 |  |  |  | 2.119 |
| 589953600.0 |  |  |  | 2.07 |
| 590649300.0 |  |  |  | 2.021 |
| 591345000.0 |  |  |  | 1.973 |
| 592040700.0 |  |  |  | 1.927 |
| 592736400.0 |  |  |  | 1.881 |
| 593432100.0 |  |  |  | 1.837 |
| 594127800.0 |  |  |  | 1.793 |
| 594823500.0 |  |  |  | 1.751 |
| 595519200.0 |  |  |  | 1.709 |
| 596214900.0 |  |  |  | 1.668 |
| 596910600.0 |  |  |  | 1.629 |
| 597606300.0 |  |  |  | 1.59 |
| 598302000.0 |  |  |  | 1.552 |
| 598997700.0 |  |  |  | 1.514 |
| 599693400.0 |  |  |  | 1.478 |
| 600389100.0 |  |  |  | 1.442 |
| 601084800.0 |  |  |  | 1.407 |
| 601780500.0 |  |  |  | 1.373 |
| 602476200.0 |  |  |  | 1.34 |
| 603171900.0 |  |  |  | 1.308 |
| 603867600.0 |  |  |  | 1.276 |
| 604563300.0 |  |  |  | 1.245 |
| 605259000.0 |  |  |  | 1.214 |
| 605954700.0 |  |  |  | 1.185 |
| 606650400.0 |  |  |  | 1.156 |
| 607346100.0 |  |  |  | 1.127 |
| 608041800.0 |  |  |  | 1.099 |
| 608737500.0 |  |  |  | 1.072 |
| 609433200.0 |  |  |  | 1.046 |
| 610128900.0 |  |  |  | 1.02 |
| 610824600.0 |  |  |  | 0.995 |
| 611520300.0 |  |  |  | 0.97 |
| 612216000.0 |  |  |  | 0.946 |
| 612911700.0 |  |  |  | 0.922 |
| 613607400.0 |  |  |  | 0.899 |
| 614303100.0 |  |  |  | 0.876 |
| 614998800.0 |  |  |  | 0.854 |
| 615694500.0 |  |  |  | 0.833 |
| 616390200.0 |  |  |  | 0.812 |
| 617085900.0 |  |  |  | 0.791 |
| 617781600.0 |  |  |  | 0.771 |
| 618477300.0 |  |  |  | 0.751 |
| 619173000.0 |  |  |  | 0.732 |
| 619868700.0 |  |  |  | 0.713 |
| 620564400.0 |  |  |  | 0.695 |
| 621260100.0 |  |  |  | 0.677 |
| 621955800.0 |  |  |  | 0.66 |
| 622651500.0 |  |  |  | 0.643 |
| 623347200.0 |  |  |  | 0.626 |
| 624042900.0 |  |  |  | 0.61 |
| 624738600.0 |  |  |  | 0.594 |
| 625434300.0 |  |  |  | 0.578 |
| 626130000.0 |  |  |  | 0.563 |
| 626825700.0 |  |  |  | 0.548 |
| 627521400.0 |  |  |  | 0.534 |
| 628217100.0 |  |  |  | 0.52 |
| 628912800.0 |  |  |  | 0.506 |
| 629608500.0 |  |  |  | 0.492 |
| 630304200.0 |  |  |  | 0.479 |
| 630999900.0 |  |  |  | 0.466 |
| 631695600.0 |  |  |  | 0.454 |
| 632391300.0 |  |  |  | 0.441 |
| 633087000.0 |  |  |  | 0.429 |
| 633782700.0 |  |  |  | 0.418 |
| 634478400.0 |  |  |  | 0.406 |
| 635174100.0 |  |  |  | 0.395 |
| 635869800.0 |  |  |  | 0.384 |
| 636565500.0 |  |  |  | 0.374 |
| 637261200.0 |  |  |  | 0.363 |
| 637956900.0 |  |  |  | 0.353 |
| 638652600.0 |  |  |  | 0.343 |
| 639348300.0 |  |  |  | 0.334 |
| 640044000.0 |  |  |  | 0.324 |
| 640739700.0 |  |  |  | 0.315 |
| 641435400.0 |  |  |  | 0.306 |
| 642131100.0 |  |  |  | 0.297 |
| 642826800.0 |  |  |  | 0.289 |
| 643522500.0 |  |  |  | 0.28 |
| 644218200.0 |  |  |  | 0.272 |
| 644913900.0 |  |  |  | 0.264 |
| 645609600.0 |  |  |  | 0.256 |
| 646305300.0 |  |  |  | 0.249 |
| 647001000.0 |  |  |  | 0.241 |
| 647696700.0 |  |  |  | 0.234 |
| 648392400.0 |  |  |  | 0.227 |
| 649088100.0 |  |  |  | 0.22 |
| 649783800.0 |  |  |  | 0.214 |
| 650479500.0 |  |  |  | 0.207 |
| 651175200.0 |  |  |  | 0.201 |
| 651870900.0 |  |  |  | 0.194 |
| 652566600.0 |  |  |  | 0.188 |
| 653262300.0 |  |  |  | 0.182 |
| 653958000.0 |  |  |  | 0.177 |
| 654653700.0 |  |  |  | 0.171 |
| 655349400.0 |  |  |  | 0.166 |
| 656045100.0 |  |  |  | 0.16 |
| 656740800.0 |  |  |  | 0.155 |
| 657436500.0 |  |  |  | 0.15 |
| 658132200.0 |  |  |  | 0.145 |
| 658827900.0 |  |  |  | 0.14 |
| 659523600.0 |  |  |  | 0.135 |
| 660219300.0 |  |  |  | 0.131 |
| 660915000.0 |  |  |  | 0.126 |
| 661610700.0 |  |  |  | 0.122 |
| 662306400.0 |  |  |  | 0.117 |
| 663002100.0 |  |  |  | 0.113 |
| 663697800.0 |  |  |  | 0.109 |
| 664393500.0 |  |  |  | 0.105 |
| 665089200.0 |  |  |  | 0.101 |
| 665784900.0 |  |  |  | 0.097 |
| 666480600.0 |  |  |  | 0.094 |
| 667176300.0 |  |  |  | 0.09 |
| 667872000.0 |  |  |  | 0.087 |
| 668567700.0 |  |  |  | 0.083 |
| 669263400.0 |  |  |  | 0.08 |
| 669959100.0 |  |  |  | 0.077 |
| 670654800.0 |  |  |  | 0.074 |
| 671350500.0 |  |  |  | 0.07 |
| 672046200.0 |  |  |  | 0.067 |
| 672741900.0 |  |  |  | 0.064 |
| 673437600.0 |  |  |  | 0.062 |
| 674133300.0 |  |  |  | 0.059 |
| 674829000.0 |  |  |  | 0.056 |
| 675524700.0 |  |  |  | 0.053 |
| 676220400.0 |  |  |  | 0.051 |
| 676916100.0 |  |  |  | 0.048 |
| 677611800.0 |  |  |  | 0.046 |
| 678307500.0 |  |  |  | 0.043 |
| 679003200.0 |  |  |  | 0.041 |
| 679698900.0 |  |  |  | 0.039 |
| 680394600.0 |  |  |  | 0.037 |
| 681090300.0 |  |  |  | 0.034 |
| 681786000.0 |  |  |  | 0.032 |
| 682481700.0 |  |  |  | 0.03 |
| 683177400.0 |  |  |  | 0.028 |
| 683873100.0 |  |  |  | 0.026 |
| 684568800.0 |  |  |  | 0.024 |
| 685264500.0 |  |  |  | 0.023 |
| 685960200.0 |  |  |  | 0.021 |
| 686655900.0 |  |  |  | 0.019 |
| 687351600.0 |  |  |  | 0.017 |
| 688047300.0 |  |  |  | 0.016 |
| 688743000.0 |  |  |  | 0.014 |
| 689438700.0 |  |  |  | 0.013 |
| 690134400.0 |  |  |  | 0.011 |
| 690830100.0 |  |  |  | 0.009 |
| 691525800.0 |  |  |  | 0.008 |
| 692221500.0 |  |  |  | 0.007 |
| 692917200.0 |  |  |  | 0.005 |
| 693612900.0 |  |  |  | 0.004 |
| 694308600.0 |  |  |  | 0.003 |
| 695004300.0 |  |  |  | 0.001 |
| 695700000.0 |  |  |  | 0 |